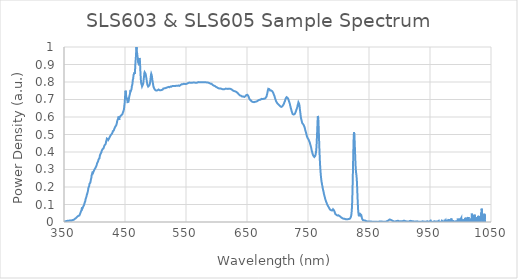
| Category | Power Density (a.u.) |
|---|---|
| 348.066 | 0.006 |
| 348.28 | 0.002 |
| 348.495 | 0.004 |
| 348.709 | 0.004 |
| 348.924 | 0.006 |
| 349.138 | 0.005 |
| 349.353 | 0.004 |
| 349.567 | 0.003 |
| 349.782 | 0.003 |
| 349.996 | 0.004 |
| 350.21 | 0.004 |
| 350.425 | 0.003 |
| 350.639 | 0.002 |
| 350.854 | 0.003 |
| 351.068 | 0.004 |
| 351.282 | 0.004 |
| 351.497 | 0.003 |
| 351.711 | 0.003 |
| 351.925 | 0.003 |
| 352.14 | 0.005 |
| 352.354 | 0.005 |
| 352.568 | 0.006 |
| 352.783 | 0.005 |
| 352.997 | 0.005 |
| 353.211 | 0.005 |
| 353.426 | 0.004 |
| 353.64 | 0.005 |
| 353.854 | 0.005 |
| 354.068 | 0.007 |
| 354.283 | 0.007 |
| 354.497 | 0.006 |
| 354.711 | 0.006 |
| 354.925 | 0.006 |
| 355.14 | 0.007 |
| 355.354 | 0.007 |
| 355.568 | 0.007 |
| 355.782 | 0.007 |
| 355.996 | 0.008 |
| 356.211 | 0.007 |
| 356.425 | 0.006 |
| 356.639 | 0.007 |
| 356.853 | 0.007 |
| 357.067 | 0.008 |
| 357.281 | 0.008 |
| 357.495 | 0.009 |
| 357.71 | 0.008 |
| 357.924 | 0.008 |
| 358.138 | 0.007 |
| 358.352 | 0.008 |
| 358.566 | 0.008 |
| 358.78 | 0.008 |
| 358.994 | 0.009 |
| 359.208 | 0.009 |
| 359.422 | 0.008 |
| 359.636 | 0.008 |
| 359.85 | 0.008 |
| 360.064 | 0.009 |
| 360.278 | 0.008 |
| 360.492 | 0.008 |
| 360.706 | 0.007 |
| 360.92 | 0.008 |
| 361.134 | 0.008 |
| 361.348 | 0.008 |
| 361.562 | 0.008 |
| 361.776 | 0.008 |
| 361.99 | 0.009 |
| 362.204 | 0.009 |
| 362.418 | 0.009 |
| 362.632 | 0.01 |
| 362.846 | 0.01 |
| 363.06 | 0.011 |
| 363.273 | 0.01 |
| 363.487 | 0.01 |
| 363.701 | 0.01 |
| 363.915 | 0.01 |
| 364.129 | 0.011 |
| 364.343 | 0.011 |
| 364.557 | 0.011 |
| 364.77 | 0.01 |
| 364.984 | 0.011 |
| 365.198 | 0.012 |
| 365.412 | 0.013 |
| 365.626 | 0.013 |
| 365.839 | 0.013 |
| 366.053 | 0.013 |
| 366.267 | 0.013 |
| 366.481 | 0.014 |
| 366.694 | 0.014 |
| 366.908 | 0.015 |
| 367.122 | 0.015 |
| 367.336 | 0.016 |
| 367.549 | 0.016 |
| 367.763 | 0.018 |
| 367.977 | 0.018 |
| 368.19 | 0.019 |
| 368.404 | 0.019 |
| 368.618 | 0.02 |
| 368.831 | 0.021 |
| 369.045 | 0.021 |
| 369.259 | 0.022 |
| 369.472 | 0.022 |
| 369.686 | 0.023 |
| 369.899 | 0.024 |
| 370.113 | 0.024 |
| 370.327 | 0.025 |
| 370.54 | 0.026 |
| 370.754 | 0.027 |
| 370.967 | 0.028 |
| 371.181 | 0.028 |
| 371.394 | 0.029 |
| 371.608 | 0.029 |
| 371.822 | 0.031 |
| 372.035 | 0.031 |
| 372.249 | 0.032 |
| 372.462 | 0.032 |
| 372.676 | 0.033 |
| 372.889 | 0.034 |
| 373.103 | 0.034 |
| 373.316 | 0.035 |
| 373.529 | 0.035 |
| 373.743 | 0.036 |
| 373.956 | 0.036 |
| 374.17 | 0.036 |
| 374.383 | 0.036 |
| 374.597 | 0.036 |
| 374.81 | 0.037 |
| 375.023 | 0.036 |
| 375.237 | 0.037 |
| 375.45 | 0.039 |
| 375.663 | 0.042 |
| 375.877 | 0.043 |
| 376.09 | 0.045 |
| 376.304 | 0.046 |
| 376.517 | 0.048 |
| 376.73 | 0.049 |
| 376.944 | 0.052 |
| 377.157 | 0.053 |
| 377.37 | 0.055 |
| 377.583 | 0.056 |
| 377.797 | 0.061 |
| 378.01 | 0.061 |
| 378.223 | 0.064 |
| 378.436 | 0.063 |
| 378.65 | 0.067 |
| 378.863 | 0.069 |
| 379.076 | 0.074 |
| 379.289 | 0.079 |
| 379.503 | 0.084 |
| 379.716 | 0.085 |
| 379.929 | 0.083 |
| 380.142 | 0.077 |
| 380.355 | 0.074 |
| 380.568 | 0.073 |
| 380.782 | 0.077 |
| 380.995 | 0.081 |
| 381.208 | 0.085 |
| 381.421 | 0.087 |
| 381.634 | 0.089 |
| 381.847 | 0.089 |
| 382.06 | 0.092 |
| 382.273 | 0.093 |
| 382.486 | 0.097 |
| 382.699 | 0.097 |
| 382.913 | 0.098 |
| 383.126 | 0.099 |
| 383.339 | 0.102 |
| 383.552 | 0.106 |
| 383.765 | 0.111 |
| 383.978 | 0.112 |
| 384.191 | 0.115 |
| 384.404 | 0.113 |
| 384.617 | 0.118 |
| 384.83 | 0.119 |
| 385.043 | 0.125 |
| 385.256 | 0.127 |
| 385.468 | 0.13 |
| 385.681 | 0.134 |
| 385.894 | 0.139 |
| 386.107 | 0.138 |
| 386.32 | 0.14 |
| 386.533 | 0.14 |
| 386.746 | 0.145 |
| 386.959 | 0.147 |
| 387.172 | 0.152 |
| 387.385 | 0.155 |
| 387.597 | 0.157 |
| 387.81 | 0.157 |
| 388.023 | 0.161 |
| 388.236 | 0.164 |
| 388.449 | 0.167 |
| 388.662 | 0.167 |
| 388.874 | 0.171 |
| 389.087 | 0.174 |
| 389.3 | 0.18 |
| 389.513 | 0.183 |
| 389.725 | 0.19 |
| 389.938 | 0.191 |
| 390.151 | 0.197 |
| 390.364 | 0.196 |
| 390.576 | 0.199 |
| 390.789 | 0.198 |
| 391.002 | 0.202 |
| 391.215 | 0.205 |
| 391.427 | 0.211 |
| 391.64 | 0.213 |
| 391.853 | 0.219 |
| 392.065 | 0.221 |
| 392.278 | 0.222 |
| 392.491 | 0.218 |
| 392.703 | 0.219 |
| 392.916 | 0.221 |
| 393.128 | 0.225 |
| 393.341 | 0.228 |
| 393.554 | 0.23 |
| 393.766 | 0.236 |
| 393.979 | 0.241 |
| 394.191 | 0.244 |
| 394.404 | 0.244 |
| 394.616 | 0.243 |
| 394.829 | 0.252 |
| 395.041 | 0.258 |
| 395.254 | 0.266 |
| 395.466 | 0.268 |
| 395.679 | 0.27 |
| 395.891 | 0.273 |
| 396.104 | 0.273 |
| 396.316 | 0.275 |
| 396.529 | 0.277 |
| 396.741 | 0.282 |
| 396.954 | 0.288 |
| 397.166 | 0.285 |
| 397.379 | 0.284 |
| 397.591 | 0.281 |
| 397.803 | 0.283 |
| 398.016 | 0.282 |
| 398.228 | 0.282 |
| 398.441 | 0.283 |
| 398.653 | 0.289 |
| 398.865 | 0.288 |
| 399.078 | 0.294 |
| 399.29 | 0.292 |
| 399.502 | 0.297 |
| 399.715 | 0.291 |
| 399.927 | 0.295 |
| 400.139 | 0.292 |
| 400.352 | 0.298 |
| 400.564 | 0.301 |
| 400.776 | 0.305 |
| 400.988 | 0.307 |
| 401.201 | 0.305 |
| 401.413 | 0.307 |
| 401.625 | 0.306 |
| 401.837 | 0.311 |
| 402.05 | 0.311 |
| 402.262 | 0.311 |
| 402.474 | 0.312 |
| 402.686 | 0.314 |
| 402.898 | 0.319 |
| 403.111 | 0.319 |
| 403.323 | 0.324 |
| 403.535 | 0.324 |
| 403.747 | 0.327 |
| 403.959 | 0.33 |
| 404.171 | 0.335 |
| 404.383 | 0.333 |
| 404.595 | 0.335 |
| 404.808 | 0.333 |
| 405.02 | 0.337 |
| 405.232 | 0.338 |
| 405.444 | 0.343 |
| 405.656 | 0.345 |
| 405.868 | 0.348 |
| 406.08 | 0.349 |
| 406.292 | 0.353 |
| 406.504 | 0.354 |
| 406.716 | 0.358 |
| 406.928 | 0.357 |
| 407.14 | 0.36 |
| 407.352 | 0.359 |
| 407.564 | 0.361 |
| 407.776 | 0.362 |
| 407.988 | 0.362 |
| 408.2 | 0.364 |
| 408.412 | 0.371 |
| 408.624 | 0.374 |
| 408.835 | 0.38 |
| 409.047 | 0.379 |
| 409.259 | 0.379 |
| 409.471 | 0.377 |
| 409.683 | 0.38 |
| 409.895 | 0.384 |
| 410.107 | 0.391 |
| 410.319 | 0.389 |
| 410.53 | 0.388 |
| 410.742 | 0.387 |
| 410.954 | 0.392 |
| 411.166 | 0.395 |
| 411.378 | 0.4 |
| 411.589 | 0.404 |
| 411.801 | 0.406 |
| 412.013 | 0.403 |
| 412.225 | 0.404 |
| 412.436 | 0.404 |
| 412.648 | 0.409 |
| 412.86 | 0.412 |
| 413.072 | 0.416 |
| 413.283 | 0.418 |
| 413.495 | 0.416 |
| 413.707 | 0.414 |
| 413.918 | 0.411 |
| 414.13 | 0.413 |
| 414.342 | 0.417 |
| 414.553 | 0.417 |
| 414.765 | 0.42 |
| 414.977 | 0.422 |
| 415.188 | 0.426 |
| 415.4 | 0.426 |
| 415.611 | 0.425 |
| 415.823 | 0.423 |
| 416.035 | 0.426 |
| 416.246 | 0.429 |
| 416.458 | 0.438 |
| 416.669 | 0.438 |
| 416.881 | 0.436 |
| 417.092 | 0.434 |
| 417.304 | 0.434 |
| 417.515 | 0.438 |
| 417.727 | 0.441 |
| 417.938 | 0.443 |
| 418.15 | 0.445 |
| 418.361 | 0.443 |
| 418.573 | 0.45 |
| 418.784 | 0.454 |
| 418.996 | 0.46 |
| 419.207 | 0.46 |
| 419.419 | 0.464 |
| 419.63 | 0.464 |
| 419.841 | 0.469 |
| 420.053 | 0.469 |
| 420.264 | 0.476 |
| 420.475 | 0.475 |
| 420.687 | 0.475 |
| 420.898 | 0.476 |
| 421.11 | 0.475 |
| 421.321 | 0.477 |
| 421.532 | 0.472 |
| 421.744 | 0.472 |
| 421.955 | 0.471 |
| 422.166 | 0.47 |
| 422.377 | 0.477 |
| 422.589 | 0.476 |
| 422.8 | 0.479 |
| 423.011 | 0.473 |
| 423.222 | 0.474 |
| 423.434 | 0.472 |
| 423.645 | 0.477 |
| 423.856 | 0.473 |
| 424.067 | 0.474 |
| 424.279 | 0.474 |
| 424.49 | 0.481 |
| 424.701 | 0.482 |
| 424.912 | 0.481 |
| 425.123 | 0.481 |
| 425.334 | 0.485 |
| 425.545 | 0.486 |
| 425.757 | 0.492 |
| 425.968 | 0.491 |
| 426.179 | 0.493 |
| 426.39 | 0.486 |
| 426.601 | 0.491 |
| 426.812 | 0.495 |
| 427.023 | 0.498 |
| 427.234 | 0.499 |
| 427.445 | 0.499 |
| 427.656 | 0.501 |
| 427.867 | 0.502 |
| 428.078 | 0.501 |
| 428.289 | 0.501 |
| 428.5 | 0.502 |
| 428.711 | 0.505 |
| 428.922 | 0.506 |
| 429.133 | 0.508 |
| 429.344 | 0.508 |
| 429.555 | 0.512 |
| 429.766 | 0.514 |
| 429.977 | 0.518 |
| 430.188 | 0.516 |
| 430.399 | 0.518 |
| 430.61 | 0.515 |
| 430.821 | 0.518 |
| 431.031 | 0.519 |
| 431.242 | 0.521 |
| 431.453 | 0.523 |
| 431.664 | 0.524 |
| 431.875 | 0.528 |
| 432.086 | 0.525 |
| 432.297 | 0.529 |
| 432.507 | 0.533 |
| 432.718 | 0.537 |
| 432.929 | 0.536 |
| 433.14 | 0.535 |
| 433.35 | 0.537 |
| 433.561 | 0.533 |
| 433.772 | 0.537 |
| 433.983 | 0.538 |
| 434.193 | 0.546 |
| 434.404 | 0.544 |
| 434.615 | 0.547 |
| 434.826 | 0.545 |
| 435.036 | 0.547 |
| 435.247 | 0.551 |
| 435.458 | 0.552 |
| 435.668 | 0.556 |
| 435.879 | 0.555 |
| 436.09 | 0.558 |
| 436.3 | 0.559 |
| 436.511 | 0.561 |
| 436.721 | 0.567 |
| 436.932 | 0.573 |
| 437.143 | 0.574 |
| 437.353 | 0.575 |
| 437.564 | 0.57 |
| 437.774 | 0.576 |
| 437.985 | 0.579 |
| 438.195 | 0.587 |
| 438.406 | 0.587 |
| 438.616 | 0.586 |
| 438.827 | 0.588 |
| 439.037 | 0.593 |
| 439.248 | 0.597 |
| 439.458 | 0.603 |
| 439.669 | 0.599 |
| 439.879 | 0.602 |
| 440.09 | 0.59 |
| 440.3 | 0.588 |
| 440.51 | 0.583 |
| 440.721 | 0.591 |
| 440.931 | 0.597 |
| 441.142 | 0.596 |
| 441.352 | 0.592 |
| 441.562 | 0.593 |
| 441.773 | 0.595 |
| 441.983 | 0.6 |
| 442.193 | 0.603 |
| 442.404 | 0.606 |
| 442.614 | 0.602 |
| 442.824 | 0.604 |
| 443.035 | 0.601 |
| 443.245 | 0.601 |
| 443.455 | 0.6 |
| 443.666 | 0.604 |
| 443.876 | 0.61 |
| 444.086 | 0.611 |
| 444.296 | 0.614 |
| 444.507 | 0.613 |
| 444.717 | 0.609 |
| 444.927 | 0.607 |
| 445.137 | 0.61 |
| 445.347 | 0.615 |
| 445.558 | 0.615 |
| 445.768 | 0.612 |
| 445.978 | 0.612 |
| 446.188 | 0.616 |
| 446.398 | 0.613 |
| 446.608 | 0.62 |
| 446.818 | 0.618 |
| 447.028 | 0.63 |
| 447.239 | 0.63 |
| 447.449 | 0.635 |
| 447.659 | 0.628 |
| 447.869 | 0.628 |
| 448.079 | 0.632 |
| 448.289 | 0.643 |
| 448.499 | 0.649 |
| 448.709 | 0.658 |
| 448.919 | 0.661 |
| 449.129 | 0.671 |
| 449.339 | 0.672 |
| 449.549 | 0.683 |
| 449.759 | 0.695 |
| 449.969 | 0.711 |
| 450.179 | 0.719 |
| 450.389 | 0.726 |
| 450.599 | 0.738 |
| 450.809 | 0.75 |
| 451.018 | 0.751 |
| 451.228 | 0.752 |
| 451.438 | 0.741 |
| 451.648 | 0.734 |
| 451.858 | 0.722 |
| 452.068 | 0.715 |
| 452.278 | 0.712 |
| 452.487 | 0.713 |
| 452.697 | 0.714 |
| 452.907 | 0.716 |
| 453.117 | 0.707 |
| 453.327 | 0.708 |
| 453.536 | 0.699 |
| 453.746 | 0.697 |
| 453.956 | 0.691 |
| 454.166 | 0.685 |
| 454.376 | 0.687 |
| 454.585 | 0.688 |
| 454.795 | 0.687 |
| 455.005 | 0.686 |
| 455.214 | 0.683 |
| 455.424 | 0.681 |
| 455.634 | 0.68 |
| 455.843 | 0.687 |
| 456.053 | 0.695 |
| 456.263 | 0.698 |
| 456.472 | 0.704 |
| 456.682 | 0.711 |
| 456.892 | 0.712 |
| 457.101 | 0.716 |
| 457.311 | 0.721 |
| 457.52 | 0.721 |
| 457.73 | 0.724 |
| 457.939 | 0.729 |
| 458.149 | 0.731 |
| 458.359 | 0.729 |
| 458.568 | 0.731 |
| 458.778 | 0.747 |
| 458.987 | 0.752 |
| 459.197 | 0.755 |
| 459.406 | 0.749 |
| 459.616 | 0.754 |
| 459.825 | 0.747 |
| 460.034 | 0.748 |
| 460.244 | 0.744 |
| 460.453 | 0.747 |
| 460.663 | 0.758 |
| 460.872 | 0.765 |
| 461.082 | 0.774 |
| 461.291 | 0.772 |
| 461.5 | 0.775 |
| 461.71 | 0.781 |
| 461.919 | 0.78 |
| 462.128 | 0.789 |
| 462.338 | 0.788 |
| 462.547 | 0.802 |
| 462.756 | 0.812 |
| 462.966 | 0.814 |
| 463.175 | 0.817 |
| 463.384 | 0.819 |
| 463.594 | 0.826 |
| 463.803 | 0.832 |
| 464.012 | 0.84 |
| 464.221 | 0.845 |
| 464.431 | 0.838 |
| 464.64 | 0.84 |
| 464.849 | 0.84 |
| 465.058 | 0.847 |
| 465.267 | 0.848 |
| 465.477 | 0.854 |
| 465.686 | 0.846 |
| 465.895 | 0.85 |
| 466.104 | 0.852 |
| 466.313 | 0.859 |
| 466.522 | 0.871 |
| 466.731 | 0.881 |
| 466.941 | 0.9 |
| 467.15 | 0.905 |
| 467.359 | 0.922 |
| 467.568 | 0.93 |
| 467.777 | 0.93 |
| 467.986 | 0.951 |
| 468.195 | 0.964 |
| 468.404 | 0.983 |
| 468.613 | 0.985 |
| 468.822 | 1 |
| 469.031 | 1 |
| 469.24 | 0.986 |
| 469.449 | 0.974 |
| 469.658 | 0.973 |
| 469.867 | 0.966 |
| 470.076 | 0.961 |
| 470.285 | 0.952 |
| 470.494 | 0.944 |
| 470.703 | 0.944 |
| 470.912 | 0.942 |
| 471.12 | 0.936 |
| 471.329 | 0.92 |
| 471.538 | 0.911 |
| 471.747 | 0.909 |
| 471.956 | 0.908 |
| 472.165 | 0.908 |
| 472.374 | 0.905 |
| 472.582 | 0.902 |
| 472.791 | 0.905 |
| 473.0 | 0.911 |
| 473.209 | 0.922 |
| 473.417 | 0.93 |
| 473.626 | 0.936 |
| 473.835 | 0.939 |
| 474.044 | 0.94 |
| 474.252 | 0.929 |
| 474.461 | 0.92 |
| 474.67 | 0.906 |
| 474.879 | 0.888 |
| 475.087 | 0.871 |
| 475.296 | 0.854 |
| 475.505 | 0.842 |
| 475.713 | 0.828 |
| 475.922 | 0.816 |
| 476.131 | 0.807 |
| 476.339 | 0.798 |
| 476.548 | 0.793 |
| 476.756 | 0.789 |
| 476.965 | 0.79 |
| 477.174 | 0.787 |
| 477.382 | 0.785 |
| 477.591 | 0.782 |
| 477.799 | 0.778 |
| 478.008 | 0.775 |
| 478.216 | 0.773 |
| 478.425 | 0.775 |
| 478.633 | 0.777 |
| 478.842 | 0.782 |
| 479.05 | 0.784 |
| 479.259 | 0.785 |
| 479.467 | 0.784 |
| 479.676 | 0.789 |
| 479.884 | 0.79 |
| 480.092 | 0.797 |
| 480.301 | 0.806 |
| 480.509 | 0.811 |
| 480.718 | 0.818 |
| 480.926 | 0.822 |
| 481.134 | 0.83 |
| 481.343 | 0.836 |
| 481.551 | 0.844 |
| 481.759 | 0.85 |
| 481.968 | 0.853 |
| 482.176 | 0.856 |
| 482.384 | 0.859 |
| 482.593 | 0.857 |
| 482.801 | 0.856 |
| 483.009 | 0.855 |
| 483.218 | 0.852 |
| 483.426 | 0.852 |
| 483.634 | 0.848 |
| 483.842 | 0.849 |
| 484.05 | 0.842 |
| 484.259 | 0.84 |
| 484.467 | 0.834 |
| 484.675 | 0.83 |
| 484.883 | 0.825 |
| 485.091 | 0.821 |
| 485.3 | 0.816 |
| 485.508 | 0.811 |
| 485.716 | 0.804 |
| 485.924 | 0.8 |
| 486.132 | 0.797 |
| 486.34 | 0.793 |
| 486.548 | 0.786 |
| 486.756 | 0.784 |
| 486.964 | 0.783 |
| 487.172 | 0.781 |
| 487.38 | 0.777 |
| 487.588 | 0.776 |
| 487.796 | 0.775 |
| 488.004 | 0.774 |
| 488.212 | 0.773 |
| 488.42 | 0.776 |
| 488.628 | 0.773 |
| 488.836 | 0.772 |
| 489.044 | 0.771 |
| 489.252 | 0.775 |
| 489.46 | 0.775 |
| 489.668 | 0.78 |
| 489.876 | 0.78 |
| 490.084 | 0.783 |
| 490.292 | 0.782 |
| 490.5 | 0.786 |
| 490.708 | 0.79 |
| 490.915 | 0.793 |
| 491.123 | 0.797 |
| 491.331 | 0.802 |
| 491.539 | 0.808 |
| 491.747 | 0.814 |
| 491.954 | 0.818 |
| 492.162 | 0.826 |
| 492.37 | 0.831 |
| 492.578 | 0.84 |
| 492.786 | 0.842 |
| 492.993 | 0.847 |
| 493.201 | 0.845 |
| 493.409 | 0.842 |
| 493.616 | 0.841 |
| 493.824 | 0.837 |
| 494.032 | 0.834 |
| 494.239 | 0.83 |
| 494.447 | 0.823 |
| 494.655 | 0.817 |
| 494.862 | 0.811 |
| 495.07 | 0.808 |
| 495.278 | 0.802 |
| 495.485 | 0.798 |
| 495.693 | 0.794 |
| 495.9 | 0.788 |
| 496.108 | 0.786 |
| 496.316 | 0.781 |
| 496.523 | 0.776 |
| 496.731 | 0.774 |
| 496.938 | 0.772 |
| 497.146 | 0.772 |
| 497.353 | 0.766 |
| 497.561 | 0.766 |
| 497.768 | 0.765 |
| 497.976 | 0.762 |
| 498.183 | 0.762 |
| 498.391 | 0.761 |
| 498.598 | 0.758 |
| 498.805 | 0.758 |
| 499.013 | 0.755 |
| 499.22 | 0.758 |
| 499.428 | 0.754 |
| 499.635 | 0.755 |
| 499.842 | 0.753 |
| 500.05 | 0.753 |
| 500.257 | 0.753 |
| 500.464 | 0.754 |
| 500.672 | 0.754 |
| 500.879 | 0.754 |
| 501.086 | 0.754 |
| 501.294 | 0.751 |
| 501.501 | 0.751 |
| 501.708 | 0.751 |
| 501.915 | 0.752 |
| 502.123 | 0.753 |
| 502.33 | 0.752 |
| 502.537 | 0.754 |
| 502.744 | 0.752 |
| 502.952 | 0.753 |
| 503.159 | 0.753 |
| 503.366 | 0.753 |
| 503.573 | 0.757 |
| 503.78 | 0.756 |
| 503.987 | 0.756 |
| 504.195 | 0.755 |
| 504.402 | 0.757 |
| 504.609 | 0.757 |
| 504.816 | 0.757 |
| 505.023 | 0.757 |
| 505.23 | 0.758 |
| 505.437 | 0.757 |
| 505.644 | 0.755 |
| 505.851 | 0.755 |
| 506.058 | 0.754 |
| 506.265 | 0.754 |
| 506.472 | 0.753 |
| 506.679 | 0.753 |
| 506.886 | 0.753 |
| 507.093 | 0.753 |
| 507.3 | 0.754 |
| 507.507 | 0.755 |
| 507.714 | 0.755 |
| 507.921 | 0.754 |
| 508.128 | 0.753 |
| 508.335 | 0.753 |
| 508.542 | 0.753 |
| 508.749 | 0.755 |
| 508.955 | 0.755 |
| 509.162 | 0.755 |
| 509.369 | 0.753 |
| 509.576 | 0.755 |
| 509.783 | 0.754 |
| 509.99 | 0.754 |
| 510.196 | 0.754 |
| 510.403 | 0.755 |
| 510.61 | 0.754 |
| 510.817 | 0.755 |
| 511.023 | 0.757 |
| 511.23 | 0.758 |
| 511.437 | 0.757 |
| 511.644 | 0.757 |
| 511.85 | 0.757 |
| 512.057 | 0.759 |
| 512.264 | 0.76 |
| 512.47 | 0.761 |
| 512.677 | 0.76 |
| 512.884 | 0.763 |
| 513.09 | 0.761 |
| 513.297 | 0.762 |
| 513.504 | 0.761 |
| 513.71 | 0.764 |
| 513.917 | 0.764 |
| 514.123 | 0.766 |
| 514.33 | 0.766 |
| 514.537 | 0.764 |
| 514.743 | 0.765 |
| 514.95 | 0.764 |
| 515.156 | 0.766 |
| 515.363 | 0.764 |
| 515.569 | 0.766 |
| 515.776 | 0.765 |
| 515.982 | 0.765 |
| 516.189 | 0.765 |
| 516.395 | 0.765 |
| 516.601 | 0.765 |
| 516.808 | 0.765 |
| 517.014 | 0.765 |
| 517.221 | 0.766 |
| 517.427 | 0.768 |
| 517.634 | 0.768 |
| 517.84 | 0.767 |
| 518.046 | 0.767 |
| 518.253 | 0.767 |
| 518.459 | 0.766 |
| 518.665 | 0.767 |
| 518.872 | 0.767 |
| 519.078 | 0.769 |
| 519.284 | 0.77 |
| 519.49 | 0.769 |
| 519.697 | 0.769 |
| 519.903 | 0.769 |
| 520.109 | 0.769 |
| 520.315 | 0.769 |
| 520.522 | 0.77 |
| 520.728 | 0.769 |
| 520.934 | 0.771 |
| 521.14 | 0.772 |
| 521.346 | 0.773 |
| 521.553 | 0.773 |
| 521.759 | 0.772 |
| 521.965 | 0.771 |
| 522.171 | 0.77 |
| 522.377 | 0.772 |
| 522.583 | 0.771 |
| 522.789 | 0.77 |
| 522.995 | 0.772 |
| 523.202 | 0.774 |
| 523.408 | 0.774 |
| 523.614 | 0.774 |
| 523.82 | 0.771 |
| 524.026 | 0.772 |
| 524.232 | 0.771 |
| 524.438 | 0.774 |
| 524.644 | 0.773 |
| 524.85 | 0.774 |
| 525.056 | 0.775 |
| 525.262 | 0.774 |
| 525.468 | 0.775 |
| 525.673 | 0.776 |
| 525.879 | 0.775 |
| 526.085 | 0.773 |
| 526.291 | 0.773 |
| 526.497 | 0.774 |
| 526.703 | 0.775 |
| 526.909 | 0.776 |
| 527.115 | 0.777 |
| 527.32 | 0.775 |
| 527.526 | 0.775 |
| 527.732 | 0.777 |
| 527.938 | 0.777 |
| 528.144 | 0.776 |
| 528.349 | 0.775 |
| 528.555 | 0.777 |
| 528.761 | 0.775 |
| 528.967 | 0.778 |
| 529.172 | 0.778 |
| 529.378 | 0.777 |
| 529.584 | 0.777 |
| 529.79 | 0.777 |
| 529.995 | 0.778 |
| 530.201 | 0.776 |
| 530.407 | 0.777 |
| 530.612 | 0.778 |
| 530.818 | 0.776 |
| 531.023 | 0.778 |
| 531.229 | 0.777 |
| 531.435 | 0.777 |
| 531.64 | 0.776 |
| 531.846 | 0.777 |
| 532.051 | 0.777 |
| 532.257 | 0.776 |
| 532.462 | 0.777 |
| 532.668 | 0.777 |
| 532.874 | 0.776 |
| 533.079 | 0.778 |
| 533.285 | 0.777 |
| 533.49 | 0.779 |
| 533.695 | 0.778 |
| 533.901 | 0.78 |
| 534.106 | 0.779 |
| 534.312 | 0.779 |
| 534.517 | 0.779 |
| 534.723 | 0.78 |
| 534.928 | 0.779 |
| 535.133 | 0.78 |
| 535.339 | 0.778 |
| 535.544 | 0.78 |
| 535.749 | 0.778 |
| 535.955 | 0.778 |
| 536.16 | 0.779 |
| 536.365 | 0.78 |
| 536.571 | 0.78 |
| 536.776 | 0.78 |
| 536.981 | 0.779 |
| 537.187 | 0.78 |
| 537.392 | 0.779 |
| 537.597 | 0.78 |
| 537.802 | 0.777 |
| 538.008 | 0.78 |
| 538.213 | 0.779 |
| 538.418 | 0.781 |
| 538.623 | 0.781 |
| 538.828 | 0.78 |
| 539.033 | 0.778 |
| 539.239 | 0.778 |
| 539.444 | 0.78 |
| 539.649 | 0.78 |
| 539.854 | 0.78 |
| 540.059 | 0.781 |
| 540.264 | 0.78 |
| 540.469 | 0.781 |
| 540.674 | 0.781 |
| 540.879 | 0.782 |
| 541.084 | 0.782 |
| 541.289 | 0.784 |
| 541.494 | 0.783 |
| 541.699 | 0.784 |
| 541.904 | 0.782 |
| 542.109 | 0.785 |
| 542.314 | 0.784 |
| 542.519 | 0.787 |
| 542.724 | 0.787 |
| 542.929 | 0.786 |
| 543.134 | 0.787 |
| 543.339 | 0.785 |
| 543.544 | 0.786 |
| 543.749 | 0.786 |
| 543.954 | 0.787 |
| 544.158 | 0.788 |
| 544.363 | 0.787 |
| 544.568 | 0.788 |
| 544.773 | 0.787 |
| 544.978 | 0.789 |
| 545.183 | 0.788 |
| 545.387 | 0.788 |
| 545.592 | 0.788 |
| 545.797 | 0.788 |
| 546.002 | 0.79 |
| 546.206 | 0.79 |
| 546.411 | 0.789 |
| 546.616 | 0.788 |
| 546.82 | 0.788 |
| 547.025 | 0.79 |
| 547.23 | 0.789 |
| 547.434 | 0.79 |
| 547.639 | 0.79 |
| 547.844 | 0.79 |
| 548.048 | 0.789 |
| 548.253 | 0.79 |
| 548.458 | 0.789 |
| 548.662 | 0.79 |
| 548.867 | 0.79 |
| 549.071 | 0.79 |
| 549.276 | 0.791 |
| 549.48 | 0.79 |
| 549.685 | 0.79 |
| 549.889 | 0.788 |
| 550.094 | 0.789 |
| 550.298 | 0.79 |
| 550.503 | 0.789 |
| 550.707 | 0.79 |
| 550.912 | 0.791 |
| 551.116 | 0.793 |
| 551.321 | 0.792 |
| 551.525 | 0.793 |
| 551.73 | 0.791 |
| 551.934 | 0.792 |
| 552.138 | 0.792 |
| 552.343 | 0.792 |
| 552.547 | 0.791 |
| 552.751 | 0.793 |
| 552.956 | 0.793 |
| 553.16 | 0.795 |
| 553.364 | 0.793 |
| 553.569 | 0.794 |
| 553.773 | 0.795 |
| 553.977 | 0.796 |
| 554.181 | 0.796 |
| 554.386 | 0.795 |
| 554.59 | 0.794 |
| 554.794 | 0.794 |
| 554.998 | 0.794 |
| 555.203 | 0.796 |
| 555.407 | 0.797 |
| 555.611 | 0.796 |
| 555.815 | 0.795 |
| 556.019 | 0.795 |
| 556.223 | 0.795 |
| 556.427 | 0.796 |
| 556.632 | 0.795 |
| 556.836 | 0.795 |
| 557.04 | 0.795 |
| 557.244 | 0.796 |
| 557.448 | 0.794 |
| 557.652 | 0.796 |
| 557.856 | 0.793 |
| 558.06 | 0.796 |
| 558.264 | 0.792 |
| 558.468 | 0.795 |
| 558.672 | 0.795 |
| 558.876 | 0.797 |
| 559.08 | 0.796 |
| 559.284 | 0.796 |
| 559.488 | 0.795 |
| 559.692 | 0.795 |
| 559.896 | 0.793 |
| 560.1 | 0.795 |
| 560.303 | 0.795 |
| 560.507 | 0.796 |
| 560.711 | 0.796 |
| 560.915 | 0.796 |
| 561.119 | 0.796 |
| 561.323 | 0.795 |
| 561.527 | 0.795 |
| 561.73 | 0.797 |
| 561.934 | 0.796 |
| 562.138 | 0.796 |
| 562.342 | 0.795 |
| 562.545 | 0.798 |
| 562.749 | 0.797 |
| 562.953 | 0.796 |
| 563.157 | 0.796 |
| 563.36 | 0.796 |
| 563.564 | 0.796 |
| 563.768 | 0.794 |
| 563.971 | 0.795 |
| 564.175 | 0.795 |
| 564.379 | 0.795 |
| 564.582 | 0.796 |
| 564.786 | 0.797 |
| 564.989 | 0.797 |
| 565.193 | 0.795 |
| 565.397 | 0.794 |
| 565.6 | 0.793 |
| 565.804 | 0.795 |
| 566.007 | 0.796 |
| 566.211 | 0.796 |
| 566.414 | 0.796 |
| 566.618 | 0.795 |
| 566.821 | 0.796 |
| 567.025 | 0.797 |
| 567.228 | 0.796 |
| 567.432 | 0.799 |
| 567.635 | 0.792 |
| 567.839 | 0.796 |
| 568.042 | 0.794 |
| 568.245 | 0.796 |
| 568.449 | 0.798 |
| 568.652 | 0.797 |
| 568.855 | 0.798 |
| 569.059 | 0.796 |
| 569.262 | 0.796 |
| 569.466 | 0.797 |
| 569.669 | 0.797 |
| 569.872 | 0.801 |
| 570.075 | 0.8 |
| 570.279 | 0.8 |
| 570.482 | 0.797 |
| 570.685 | 0.797 |
| 570.888 | 0.797 |
| 571.092 | 0.799 |
| 571.295 | 0.8 |
| 571.498 | 0.8 |
| 571.701 | 0.8 |
| 571.904 | 0.798 |
| 572.108 | 0.796 |
| 572.311 | 0.796 |
| 572.514 | 0.796 |
| 572.717 | 0.799 |
| 572.92 | 0.799 |
| 573.123 | 0.799 |
| 573.326 | 0.797 |
| 573.529 | 0.796 |
| 573.732 | 0.798 |
| 573.935 | 0.798 |
| 574.139 | 0.799 |
| 574.342 | 0.797 |
| 574.545 | 0.798 |
| 574.748 | 0.797 |
| 574.951 | 0.797 |
| 575.154 | 0.798 |
| 575.356 | 0.798 |
| 575.559 | 0.798 |
| 575.762 | 0.799 |
| 575.965 | 0.799 |
| 576.168 | 0.799 |
| 576.371 | 0.798 |
| 576.574 | 0.799 |
| 576.777 | 0.799 |
| 576.98 | 0.798 |
| 577.183 | 0.798 |
| 577.385 | 0.798 |
| 577.588 | 0.799 |
| 577.791 | 0.798 |
| 577.994 | 0.799 |
| 578.197 | 0.798 |
| 578.399 | 0.798 |
| 578.602 | 0.797 |
| 578.805 | 0.799 |
| 579.008 | 0.797 |
| 579.21 | 0.799 |
| 579.413 | 0.796 |
| 579.616 | 0.8 |
| 579.818 | 0.797 |
| 580.021 | 0.799 |
| 580.224 | 0.796 |
| 580.426 | 0.797 |
| 580.629 | 0.798 |
| 580.832 | 0.799 |
| 581.034 | 0.798 |
| 581.237 | 0.798 |
| 581.439 | 0.798 |
| 581.642 | 0.799 |
| 581.844 | 0.797 |
| 582.047 | 0.798 |
| 582.25 | 0.795 |
| 582.452 | 0.796 |
| 582.655 | 0.795 |
| 582.857 | 0.798 |
| 583.06 | 0.796 |
| 583.262 | 0.799 |
| 583.464 | 0.796 |
| 583.667 | 0.798 |
| 583.869 | 0.796 |
| 584.072 | 0.798 |
| 584.274 | 0.795 |
| 584.476 | 0.797 |
| 584.679 | 0.797 |
| 584.881 | 0.797 |
| 585.084 | 0.796 |
| 585.286 | 0.795 |
| 585.488 | 0.796 |
| 585.691 | 0.796 |
| 585.893 | 0.794 |
| 586.095 | 0.796 |
| 586.297 | 0.795 |
| 586.5 | 0.796 |
| 586.702 | 0.796 |
| 586.904 | 0.796 |
| 587.106 | 0.796 |
| 587.309 | 0.794 |
| 587.511 | 0.794 |
| 587.713 | 0.795 |
| 587.915 | 0.794 |
| 588.117 | 0.794 |
| 588.319 | 0.794 |
| 588.521 | 0.794 |
| 588.724 | 0.794 |
| 588.926 | 0.791 |
| 589.128 | 0.792 |
| 589.33 | 0.793 |
| 589.532 | 0.793 |
| 589.734 | 0.794 |
| 589.936 | 0.791 |
| 590.138 | 0.79 |
| 590.34 | 0.79 |
| 590.542 | 0.792 |
| 590.744 | 0.79 |
| 590.946 | 0.791 |
| 591.148 | 0.79 |
| 591.35 | 0.791 |
| 591.552 | 0.788 |
| 591.754 | 0.789 |
| 591.956 | 0.79 |
| 592.158 | 0.789 |
| 592.359 | 0.788 |
| 592.561 | 0.787 |
| 592.763 | 0.787 |
| 592.965 | 0.787 |
| 593.167 | 0.785 |
| 593.369 | 0.784 |
| 593.57 | 0.784 |
| 593.772 | 0.784 |
| 593.974 | 0.785 |
| 594.176 | 0.784 |
| 594.378 | 0.785 |
| 594.579 | 0.783 |
| 594.781 | 0.782 |
| 594.983 | 0.782 |
| 595.184 | 0.78 |
| 595.386 | 0.781 |
| 595.588 | 0.779 |
| 595.789 | 0.782 |
| 595.991 | 0.78 |
| 596.193 | 0.781 |
| 596.394 | 0.778 |
| 596.596 | 0.778 |
| 596.798 | 0.777 |
| 596.999 | 0.778 |
| 597.201 | 0.776 |
| 597.402 | 0.777 |
| 597.604 | 0.776 |
| 597.805 | 0.775 |
| 598.007 | 0.775 |
| 598.208 | 0.773 |
| 598.41 | 0.773 |
| 598.611 | 0.773 |
| 598.813 | 0.773 |
| 599.014 | 0.773 |
| 599.216 | 0.771 |
| 599.417 | 0.771 |
| 599.618 | 0.772 |
| 599.82 | 0.771 |
| 600.021 | 0.77 |
| 600.223 | 0.769 |
| 600.424 | 0.769 |
| 600.625 | 0.77 |
| 600.827 | 0.769 |
| 601.028 | 0.768 |
| 601.229 | 0.767 |
| 601.431 | 0.767 |
| 601.632 | 0.765 |
| 601.833 | 0.767 |
| 602.034 | 0.766 |
| 602.236 | 0.765 |
| 602.437 | 0.765 |
| 602.638 | 0.765 |
| 602.839 | 0.766 |
| 603.04 | 0.765 |
| 603.242 | 0.764 |
| 603.443 | 0.764 |
| 603.644 | 0.761 |
| 603.845 | 0.763 |
| 604.046 | 0.763 |
| 604.247 | 0.763 |
| 604.448 | 0.762 |
| 604.649 | 0.762 |
| 604.851 | 0.763 |
| 605.052 | 0.763 |
| 605.253 | 0.763 |
| 605.454 | 0.762 |
| 605.655 | 0.762 |
| 605.856 | 0.76 |
| 606.057 | 0.763 |
| 606.258 | 0.762 |
| 606.459 | 0.761 |
| 606.66 | 0.761 |
| 606.86 | 0.76 |
| 607.061 | 0.76 |
| 607.262 | 0.759 |
| 607.463 | 0.762 |
| 607.664 | 0.759 |
| 607.865 | 0.762 |
| 608.066 | 0.758 |
| 608.267 | 0.76 |
| 608.467 | 0.759 |
| 608.668 | 0.759 |
| 608.869 | 0.758 |
| 609.07 | 0.759 |
| 609.271 | 0.759 |
| 609.471 | 0.76 |
| 609.672 | 0.759 |
| 609.873 | 0.76 |
| 610.074 | 0.76 |
| 610.274 | 0.758 |
| 610.475 | 0.76 |
| 610.676 | 0.759 |
| 610.876 | 0.76 |
| 611.077 | 0.76 |
| 611.278 | 0.759 |
| 611.478 | 0.759 |
| 611.679 | 0.758 |
| 611.88 | 0.76 |
| 612.08 | 0.76 |
| 612.281 | 0.76 |
| 612.481 | 0.76 |
| 612.682 | 0.759 |
| 612.882 | 0.759 |
| 613.083 | 0.761 |
| 613.283 | 0.759 |
| 613.484 | 0.761 |
| 613.684 | 0.759 |
| 613.885 | 0.758 |
| 614.085 | 0.759 |
| 614.286 | 0.761 |
| 614.486 | 0.763 |
| 614.687 | 0.761 |
| 614.887 | 0.762 |
| 615.087 | 0.762 |
| 615.288 | 0.761 |
| 615.488 | 0.763 |
| 615.688 | 0.762 |
| 615.889 | 0.762 |
| 616.089 | 0.761 |
| 616.289 | 0.762 |
| 616.49 | 0.761 |
| 616.69 | 0.761 |
| 616.89 | 0.761 |
| 617.09 | 0.762 |
| 617.291 | 0.76 |
| 617.491 | 0.762 |
| 617.691 | 0.762 |
| 617.891 | 0.761 |
| 618.092 | 0.761 |
| 618.292 | 0.761 |
| 618.492 | 0.761 |
| 618.692 | 0.761 |
| 618.892 | 0.761 |
| 619.092 | 0.761 |
| 619.292 | 0.762 |
| 619.492 | 0.762 |
| 619.693 | 0.761 |
| 619.893 | 0.761 |
| 620.093 | 0.762 |
| 620.293 | 0.762 |
| 620.493 | 0.761 |
| 620.693 | 0.762 |
| 620.893 | 0.761 |
| 621.093 | 0.762 |
| 621.293 | 0.761 |
| 621.493 | 0.762 |
| 621.693 | 0.76 |
| 621.893 | 0.761 |
| 622.092 | 0.761 |
| 622.292 | 0.761 |
| 622.492 | 0.761 |
| 622.692 | 0.762 |
| 622.892 | 0.76 |
| 623.092 | 0.76 |
| 623.292 | 0.761 |
| 623.491 | 0.762 |
| 623.691 | 0.761 |
| 623.891 | 0.759 |
| 624.091 | 0.759 |
| 624.291 | 0.758 |
| 624.49 | 0.757 |
| 624.69 | 0.757 |
| 624.89 | 0.757 |
| 625.09 | 0.757 |
| 625.289 | 0.757 |
| 625.489 | 0.758 |
| 625.689 | 0.755 |
| 625.888 | 0.755 |
| 626.088 | 0.754 |
| 626.288 | 0.754 |
| 626.487 | 0.754 |
| 626.687 | 0.754 |
| 626.886 | 0.755 |
| 627.086 | 0.754 |
| 627.285 | 0.753 |
| 627.485 | 0.751 |
| 627.685 | 0.75 |
| 627.884 | 0.749 |
| 628.084 | 0.75 |
| 628.283 | 0.751 |
| 628.483 | 0.751 |
| 628.682 | 0.749 |
| 628.881 | 0.748 |
| 629.081 | 0.749 |
| 629.28 | 0.749 |
| 629.48 | 0.748 |
| 629.679 | 0.746 |
| 629.879 | 0.746 |
| 630.078 | 0.746 |
| 630.277 | 0.747 |
| 630.477 | 0.745 |
| 630.676 | 0.745 |
| 630.875 | 0.745 |
| 631.075 | 0.747 |
| 631.274 | 0.746 |
| 631.473 | 0.747 |
| 631.672 | 0.744 |
| 631.872 | 0.744 |
| 632.071 | 0.742 |
| 632.27 | 0.744 |
| 632.469 | 0.742 |
| 632.668 | 0.743 |
| 632.868 | 0.741 |
| 633.067 | 0.742 |
| 633.266 | 0.74 |
| 633.465 | 0.741 |
| 633.664 | 0.739 |
| 633.863 | 0.74 |
| 634.062 | 0.738 |
| 634.261 | 0.738 |
| 634.461 | 0.737 |
| 634.66 | 0.738 |
| 634.859 | 0.736 |
| 635.058 | 0.736 |
| 635.257 | 0.735 |
| 635.456 | 0.735 |
| 635.655 | 0.733 |
| 635.854 | 0.734 |
| 636.053 | 0.734 |
| 636.252 | 0.734 |
| 636.45 | 0.731 |
| 636.649 | 0.729 |
| 636.848 | 0.727 |
| 637.047 | 0.73 |
| 637.246 | 0.728 |
| 637.445 | 0.728 |
| 637.644 | 0.727 |
| 637.843 | 0.727 |
| 638.041 | 0.725 |
| 638.24 | 0.725 |
| 638.439 | 0.724 |
| 638.638 | 0.727 |
| 638.837 | 0.723 |
| 639.035 | 0.724 |
| 639.234 | 0.723 |
| 639.433 | 0.723 |
| 639.631 | 0.72 |
| 639.83 | 0.72 |
| 640.029 | 0.72 |
| 640.227 | 0.721 |
| 640.426 | 0.719 |
| 640.625 | 0.72 |
| 640.823 | 0.718 |
| 641.022 | 0.719 |
| 641.221 | 0.718 |
| 641.419 | 0.718 |
| 641.618 | 0.717 |
| 641.816 | 0.718 |
| 642.015 | 0.717 |
| 642.213 | 0.717 |
| 642.412 | 0.717 |
| 642.61 | 0.716 |
| 642.809 | 0.716 |
| 643.007 | 0.716 |
| 643.206 | 0.716 |
| 643.404 | 0.718 |
| 643.603 | 0.715 |
| 643.801 | 0.717 |
| 643.999 | 0.716 |
| 644.198 | 0.718 |
| 644.396 | 0.715 |
| 644.595 | 0.715 |
| 644.793 | 0.715 |
| 644.991 | 0.716 |
| 645.19 | 0.716 |
| 645.388 | 0.715 |
| 645.586 | 0.715 |
| 645.784 | 0.716 |
| 645.983 | 0.717 |
| 646.181 | 0.717 |
| 646.379 | 0.719 |
| 646.577 | 0.716 |
| 646.776 | 0.717 |
| 646.974 | 0.717 |
| 647.172 | 0.72 |
| 647.37 | 0.719 |
| 647.568 | 0.719 |
| 647.766 | 0.721 |
| 647.965 | 0.722 |
| 648.163 | 0.722 |
| 648.361 | 0.723 |
| 648.559 | 0.724 |
| 648.757 | 0.724 |
| 648.955 | 0.726 |
| 649.153 | 0.726 |
| 649.351 | 0.728 |
| 649.549 | 0.726 |
| 649.747 | 0.727 |
| 649.945 | 0.727 |
| 650.143 | 0.727 |
| 650.341 | 0.728 |
| 650.539 | 0.726 |
| 650.737 | 0.727 |
| 650.935 | 0.728 |
| 651.133 | 0.728 |
| 651.33 | 0.727 |
| 651.528 | 0.724 |
| 651.726 | 0.723 |
| 651.924 | 0.721 |
| 652.122 | 0.72 |
| 652.32 | 0.719 |
| 652.517 | 0.716 |
| 652.715 | 0.715 |
| 652.913 | 0.714 |
| 653.111 | 0.711 |
| 653.308 | 0.709 |
| 653.506 | 0.707 |
| 653.704 | 0.707 |
| 653.902 | 0.706 |
| 654.099 | 0.706 |
| 654.297 | 0.703 |
| 654.495 | 0.7 |
| 654.692 | 0.7 |
| 654.89 | 0.7 |
| 655.088 | 0.698 |
| 655.285 | 0.698 |
| 655.483 | 0.698 |
| 655.68 | 0.698 |
| 655.878 | 0.696 |
| 656.075 | 0.695 |
| 656.273 | 0.695 |
| 656.47 | 0.692 |
| 656.668 | 0.694 |
| 656.865 | 0.693 |
| 657.063 | 0.693 |
| 657.26 | 0.691 |
| 657.458 | 0.69 |
| 657.655 | 0.689 |
| 657.853 | 0.689 |
| 658.05 | 0.689 |
| 658.247 | 0.689 |
| 658.445 | 0.688 |
| 658.642 | 0.688 |
| 658.839 | 0.689 |
| 659.037 | 0.688 |
| 659.234 | 0.687 |
| 659.431 | 0.686 |
| 659.629 | 0.686 |
| 659.826 | 0.687 |
| 660.023 | 0.687 |
| 660.22 | 0.687 |
| 660.418 | 0.687 |
| 660.615 | 0.687 |
| 660.812 | 0.687 |
| 661.009 | 0.686 |
| 661.206 | 0.685 |
| 661.404 | 0.685 |
| 661.601 | 0.684 |
| 661.798 | 0.686 |
| 661.995 | 0.686 |
| 662.192 | 0.686 |
| 662.389 | 0.685 |
| 662.586 | 0.685 |
| 662.783 | 0.686 |
| 662.98 | 0.687 |
| 663.177 | 0.687 |
| 663.374 | 0.686 |
| 663.571 | 0.687 |
| 663.768 | 0.686 |
| 663.965 | 0.686 |
| 664.162 | 0.686 |
| 664.359 | 0.688 |
| 664.556 | 0.687 |
| 664.753 | 0.689 |
| 664.95 | 0.688 |
| 665.147 | 0.69 |
| 665.344 | 0.689 |
| 665.541 | 0.69 |
| 665.737 | 0.689 |
| 665.934 | 0.69 |
| 666.131 | 0.691 |
| 666.328 | 0.692 |
| 666.525 | 0.692 |
| 666.721 | 0.691 |
| 666.918 | 0.691 |
| 667.115 | 0.692 |
| 667.312 | 0.693 |
| 667.508 | 0.693 |
| 667.705 | 0.694 |
| 667.902 | 0.695 |
| 668.098 | 0.694 |
| 668.295 | 0.694 |
| 668.492 | 0.695 |
| 668.688 | 0.696 |
| 668.885 | 0.696 |
| 669.081 | 0.696 |
| 669.278 | 0.698 |
| 669.475 | 0.698 |
| 669.671 | 0.698 |
| 669.868 | 0.699 |
| 670.064 | 0.698 |
| 670.261 | 0.698 |
| 670.457 | 0.696 |
| 670.654 | 0.698 |
| 670.85 | 0.698 |
| 671.047 | 0.701 |
| 671.243 | 0.701 |
| 671.439 | 0.702 |
| 671.636 | 0.7 |
| 671.832 | 0.699 |
| 672.029 | 0.699 |
| 672.225 | 0.699 |
| 672.421 | 0.702 |
| 672.618 | 0.702 |
| 672.814 | 0.702 |
| 673.01 | 0.702 |
| 673.207 | 0.701 |
| 673.403 | 0.702 |
| 673.599 | 0.702 |
| 673.795 | 0.704 |
| 673.992 | 0.703 |
| 674.188 | 0.7 |
| 674.384 | 0.702 |
| 674.58 | 0.702 |
| 674.776 | 0.704 |
| 674.973 | 0.701 |
| 675.169 | 0.703 |
| 675.365 | 0.703 |
| 675.561 | 0.702 |
| 675.757 | 0.703 |
| 675.953 | 0.701 |
| 676.149 | 0.702 |
| 676.345 | 0.702 |
| 676.541 | 0.704 |
| 676.737 | 0.704 |
| 676.933 | 0.704 |
| 677.129 | 0.704 |
| 677.325 | 0.704 |
| 677.521 | 0.704 |
| 677.717 | 0.705 |
| 677.913 | 0.705 |
| 678.109 | 0.704 |
| 678.305 | 0.705 |
| 678.501 | 0.706 |
| 678.697 | 0.704 |
| 678.893 | 0.705 |
| 679.089 | 0.705 |
| 679.284 | 0.707 |
| 679.48 | 0.705 |
| 679.676 | 0.707 |
| 679.872 | 0.705 |
| 680.068 | 0.705 |
| 680.263 | 0.707 |
| 680.459 | 0.709 |
| 680.655 | 0.709 |
| 680.851 | 0.71 |
| 681.046 | 0.71 |
| 681.242 | 0.713 |
| 681.438 | 0.713 |
| 681.633 | 0.715 |
| 681.829 | 0.716 |
| 682.025 | 0.718 |
| 682.22 | 0.722 |
| 682.416 | 0.723 |
| 682.611 | 0.726 |
| 682.807 | 0.728 |
| 683.002 | 0.731 |
| 683.198 | 0.733 |
| 683.394 | 0.737 |
| 683.589 | 0.741 |
| 683.785 | 0.744 |
| 683.98 | 0.748 |
| 684.176 | 0.751 |
| 684.371 | 0.754 |
| 684.566 | 0.757 |
| 684.762 | 0.76 |
| 684.957 | 0.761 |
| 685.153 | 0.764 |
| 685.348 | 0.763 |
| 685.543 | 0.764 |
| 685.739 | 0.76 |
| 685.934 | 0.763 |
| 686.129 | 0.762 |
| 686.325 | 0.764 |
| 686.52 | 0.759 |
| 686.715 | 0.759 |
| 686.911 | 0.756 |
| 687.106 | 0.756 |
| 687.301 | 0.757 |
| 687.496 | 0.755 |
| 687.691 | 0.756 |
| 687.887 | 0.751 |
| 688.082 | 0.752 |
| 688.277 | 0.751 |
| 688.472 | 0.751 |
| 688.667 | 0.749 |
| 688.862 | 0.75 |
| 689.057 | 0.752 |
| 689.253 | 0.752 |
| 689.448 | 0.753 |
| 689.643 | 0.752 |
| 689.838 | 0.752 |
| 690.033 | 0.749 |
| 690.228 | 0.75 |
| 690.423 | 0.751 |
| 690.618 | 0.751 |
| 690.813 | 0.75 |
| 691.008 | 0.748 |
| 691.203 | 0.749 |
| 691.398 | 0.747 |
| 691.592 | 0.749 |
| 691.787 | 0.747 |
| 691.982 | 0.748 |
| 692.177 | 0.747 |
| 692.372 | 0.744 |
| 692.567 | 0.743 |
| 692.762 | 0.74 |
| 692.956 | 0.739 |
| 693.151 | 0.738 |
| 693.346 | 0.737 |
| 693.541 | 0.734 |
| 693.735 | 0.731 |
| 693.93 | 0.728 |
| 694.125 | 0.728 |
| 694.32 | 0.725 |
| 694.514 | 0.724 |
| 694.709 | 0.722 |
| 694.904 | 0.72 |
| 695.098 | 0.718 |
| 695.293 | 0.716 |
| 695.487 | 0.714 |
| 695.682 | 0.712 |
| 695.877 | 0.709 |
| 696.071 | 0.708 |
| 696.266 | 0.704 |
| 696.46 | 0.703 |
| 696.655 | 0.7 |
| 696.849 | 0.697 |
| 697.044 | 0.697 |
| 697.238 | 0.695 |
| 697.433 | 0.693 |
| 697.627 | 0.69 |
| 697.822 | 0.69 |
| 698.016 | 0.689 |
| 698.21 | 0.687 |
| 698.405 | 0.686 |
| 698.599 | 0.685 |
| 698.793 | 0.685 |
| 698.988 | 0.681 |
| 699.182 | 0.681 |
| 699.376 | 0.679 |
| 699.571 | 0.68 |
| 699.765 | 0.678 |
| 699.959 | 0.678 |
| 700.154 | 0.677 |
| 700.348 | 0.677 |
| 700.542 | 0.675 |
| 700.736 | 0.675 |
| 700.93 | 0.673 |
| 701.125 | 0.673 |
| 701.319 | 0.673 |
| 701.513 | 0.672 |
| 701.707 | 0.671 |
| 701.901 | 0.67 |
| 702.095 | 0.67 |
| 702.289 | 0.669 |
| 702.483 | 0.668 |
| 702.677 | 0.668 |
| 702.871 | 0.668 |
| 703.065 | 0.667 |
| 703.259 | 0.666 |
| 703.453 | 0.665 |
| 703.647 | 0.664 |
| 703.841 | 0.663 |
| 704.035 | 0.662 |
| 704.229 | 0.662 |
| 704.423 | 0.662 |
| 704.617 | 0.661 |
| 704.811 | 0.661 |
| 705.005 | 0.659 |
| 705.199 | 0.659 |
| 705.392 | 0.658 |
| 705.586 | 0.657 |
| 705.78 | 0.659 |
| 705.974 | 0.658 |
| 706.168 | 0.659 |
| 706.361 | 0.657 |
| 706.555 | 0.657 |
| 706.749 | 0.658 |
| 706.943 | 0.658 |
| 707.136 | 0.659 |
| 707.33 | 0.658 |
| 707.524 | 0.659 |
| 707.717 | 0.66 |
| 707.911 | 0.661 |
| 708.105 | 0.661 |
| 708.298 | 0.662 |
| 708.492 | 0.664 |
| 708.685 | 0.664 |
| 708.879 | 0.665 |
| 709.073 | 0.665 |
| 709.266 | 0.667 |
| 709.46 | 0.668 |
| 709.653 | 0.669 |
| 709.847 | 0.672 |
| 710.04 | 0.672 |
| 710.234 | 0.673 |
| 710.427 | 0.675 |
| 710.62 | 0.676 |
| 710.814 | 0.678 |
| 711.007 | 0.68 |
| 711.201 | 0.684 |
| 711.394 | 0.686 |
| 711.587 | 0.686 |
| 711.781 | 0.688 |
| 711.974 | 0.69 |
| 712.167 | 0.69 |
| 712.361 | 0.694 |
| 712.554 | 0.696 |
| 712.747 | 0.699 |
| 712.94 | 0.701 |
| 713.134 | 0.702 |
| 713.327 | 0.703 |
| 713.52 | 0.704 |
| 713.713 | 0.708 |
| 713.906 | 0.708 |
| 714.1 | 0.71 |
| 714.293 | 0.712 |
| 714.486 | 0.713 |
| 714.679 | 0.713 |
| 714.872 | 0.713 |
| 715.065 | 0.715 |
| 715.258 | 0.714 |
| 715.451 | 0.713 |
| 715.644 | 0.713 |
| 715.837 | 0.714 |
| 716.03 | 0.713 |
| 716.223 | 0.714 |
| 716.416 | 0.713 |
| 716.609 | 0.709 |
| 716.802 | 0.709 |
| 716.995 | 0.707 |
| 717.188 | 0.708 |
| 717.381 | 0.706 |
| 717.574 | 0.704 |
| 717.766 | 0.702 |
| 717.959 | 0.698 |
| 718.152 | 0.698 |
| 718.345 | 0.696 |
| 718.538 | 0.695 |
| 718.731 | 0.692 |
| 718.923 | 0.689 |
| 719.116 | 0.687 |
| 719.309 | 0.685 |
| 719.502 | 0.683 |
| 719.694 | 0.681 |
| 719.887 | 0.681 |
| 720.08 | 0.678 |
| 720.272 | 0.675 |
| 720.465 | 0.671 |
| 720.658 | 0.666 |
| 720.85 | 0.664 |
| 721.043 | 0.662 |
| 721.235 | 0.66 |
| 721.428 | 0.658 |
| 721.62 | 0.653 |
| 721.813 | 0.652 |
| 722.006 | 0.648 |
| 722.198 | 0.647 |
| 722.391 | 0.643 |
| 722.583 | 0.641 |
| 722.775 | 0.639 |
| 722.968 | 0.636 |
| 723.16 | 0.634 |
| 723.353 | 0.632 |
| 723.545 | 0.629 |
| 723.738 | 0.629 |
| 723.93 | 0.626 |
| 724.122 | 0.624 |
| 724.315 | 0.622 |
| 724.507 | 0.621 |
| 724.699 | 0.62 |
| 724.891 | 0.616 |
| 725.084 | 0.617 |
| 725.276 | 0.617 |
| 725.468 | 0.615 |
| 725.66 | 0.616 |
| 725.853 | 0.615 |
| 726.045 | 0.615 |
| 726.237 | 0.614 |
| 726.429 | 0.612 |
| 726.621 | 0.614 |
| 726.814 | 0.612 |
| 727.006 | 0.614 |
| 727.198 | 0.613 |
| 727.39 | 0.615 |
| 727.582 | 0.614 |
| 727.774 | 0.616 |
| 727.966 | 0.616 |
| 728.158 | 0.618 |
| 728.35 | 0.618 |
| 728.542 | 0.619 |
| 728.734 | 0.621 |
| 728.926 | 0.622 |
| 729.118 | 0.623 |
| 729.31 | 0.625 |
| 729.502 | 0.626 |
| 729.694 | 0.63 |
| 729.886 | 0.629 |
| 730.077 | 0.632 |
| 730.269 | 0.633 |
| 730.461 | 0.636 |
| 730.653 | 0.636 |
| 730.845 | 0.64 |
| 731.036 | 0.64 |
| 731.228 | 0.643 |
| 731.42 | 0.643 |
| 731.612 | 0.647 |
| 731.803 | 0.647 |
| 731.995 | 0.651 |
| 732.187 | 0.653 |
| 732.379 | 0.657 |
| 732.57 | 0.656 |
| 732.762 | 0.66 |
| 732.953 | 0.662 |
| 733.145 | 0.67 |
| 733.337 | 0.67 |
| 733.528 | 0.674 |
| 733.72 | 0.672 |
| 733.911 | 0.678 |
| 734.103 | 0.679 |
| 734.294 | 0.684 |
| 734.486 | 0.682 |
| 734.677 | 0.684 |
| 734.869 | 0.68 |
| 735.06 | 0.68 |
| 735.252 | 0.677 |
| 735.443 | 0.676 |
| 735.635 | 0.671 |
| 735.826 | 0.67 |
| 736.017 | 0.664 |
| 736.209 | 0.661 |
| 736.4 | 0.653 |
| 736.592 | 0.649 |
| 736.783 | 0.641 |
| 736.974 | 0.637 |
| 737.165 | 0.631 |
| 737.357 | 0.628 |
| 737.548 | 0.621 |
| 737.739 | 0.616 |
| 737.93 | 0.609 |
| 738.122 | 0.607 |
| 738.313 | 0.599 |
| 738.504 | 0.596 |
| 738.695 | 0.591 |
| 738.886 | 0.589 |
| 739.077 | 0.586 |
| 739.269 | 0.583 |
| 739.46 | 0.58 |
| 739.651 | 0.58 |
| 739.842 | 0.575 |
| 740.033 | 0.576 |
| 740.224 | 0.569 |
| 740.415 | 0.572 |
| 740.606 | 0.565 |
| 740.797 | 0.567 |
| 740.988 | 0.565 |
| 741.179 | 0.565 |
| 741.37 | 0.563 |
| 741.561 | 0.562 |
| 741.752 | 0.56 |
| 741.942 | 0.561 |
| 742.133 | 0.558 |
| 742.324 | 0.559 |
| 742.515 | 0.555 |
| 742.706 | 0.557 |
| 742.897 | 0.554 |
| 743.087 | 0.554 |
| 743.278 | 0.551 |
| 743.469 | 0.551 |
| 743.66 | 0.549 |
| 743.85 | 0.548 |
| 744.041 | 0.545 |
| 744.232 | 0.543 |
| 744.423 | 0.54 |
| 744.613 | 0.539 |
| 744.804 | 0.536 |
| 744.994 | 0.536 |
| 745.185 | 0.53 |
| 745.376 | 0.53 |
| 745.566 | 0.524 |
| 745.757 | 0.524 |
| 745.947 | 0.519 |
| 746.138 | 0.518 |
| 746.328 | 0.515 |
| 746.519 | 0.515 |
| 746.709 | 0.512 |
| 746.9 | 0.509 |
| 747.09 | 0.506 |
| 747.281 | 0.505 |
| 747.471 | 0.5 |
| 747.662 | 0.5 |
| 747.852 | 0.495 |
| 748.042 | 0.495 |
| 748.233 | 0.49 |
| 748.423 | 0.49 |
| 748.613 | 0.486 |
| 748.804 | 0.486 |
| 748.994 | 0.484 |
| 749.184 | 0.484 |
| 749.375 | 0.48 |
| 749.565 | 0.481 |
| 749.755 | 0.478 |
| 749.945 | 0.479 |
| 750.136 | 0.475 |
| 750.326 | 0.476 |
| 750.516 | 0.473 |
| 750.706 | 0.475 |
| 750.896 | 0.471 |
| 751.086 | 0.471 |
| 751.276 | 0.466 |
| 751.467 | 0.468 |
| 751.657 | 0.465 |
| 751.847 | 0.467 |
| 752.037 | 0.464 |
| 752.227 | 0.463 |
| 752.417 | 0.459 |
| 752.607 | 0.459 |
| 752.797 | 0.455 |
| 752.987 | 0.455 |
| 753.177 | 0.451 |
| 753.367 | 0.45 |
| 753.556 | 0.445 |
| 753.746 | 0.444 |
| 753.936 | 0.44 |
| 754.126 | 0.439 |
| 754.316 | 0.436 |
| 754.506 | 0.436 |
| 754.696 | 0.432 |
| 754.885 | 0.431 |
| 755.075 | 0.427 |
| 755.265 | 0.425 |
| 755.455 | 0.42 |
| 755.644 | 0.418 |
| 755.834 | 0.413 |
| 756.024 | 0.412 |
| 756.214 | 0.407 |
| 756.403 | 0.407 |
| 756.593 | 0.402 |
| 756.782 | 0.401 |
| 756.972 | 0.395 |
| 757.162 | 0.397 |
| 757.351 | 0.391 |
| 757.541 | 0.392 |
| 757.73 | 0.385 |
| 757.92 | 0.387 |
| 758.109 | 0.384 |
| 758.299 | 0.385 |
| 758.488 | 0.381 |
| 758.678 | 0.381 |
| 758.867 | 0.378 |
| 759.057 | 0.378 |
| 759.246 | 0.375 |
| 759.436 | 0.377 |
| 759.625 | 0.375 |
| 759.814 | 0.377 |
| 760.004 | 0.373 |
| 760.193 | 0.374 |
| 760.383 | 0.372 |
| 760.572 | 0.373 |
| 760.761 | 0.371 |
| 760.95 | 0.374 |
| 761.14 | 0.371 |
| 761.329 | 0.374 |
| 761.518 | 0.374 |
| 761.707 | 0.377 |
| 761.897 | 0.376 |
| 762.086 | 0.378 |
| 762.275 | 0.379 |
| 762.464 | 0.385 |
| 762.653 | 0.386 |
| 762.842 | 0.393 |
| 763.031 | 0.395 |
| 763.221 | 0.402 |
| 763.41 | 0.405 |
| 763.599 | 0.416 |
| 763.788 | 0.424 |
| 763.977 | 0.437 |
| 764.166 | 0.447 |
| 764.355 | 0.463 |
| 764.544 | 0.476 |
| 764.733 | 0.493 |
| 764.922 | 0.507 |
| 765.11 | 0.526 |
| 765.299 | 0.54 |
| 765.488 | 0.558 |
| 765.677 | 0.572 |
| 765.866 | 0.589 |
| 766.055 | 0.597 |
| 766.244 | 0.606 |
| 766.432 | 0.605 |
| 766.621 | 0.603 |
| 766.81 | 0.592 |
| 766.999 | 0.583 |
| 767.188 | 0.568 |
| 767.376 | 0.553 |
| 767.565 | 0.533 |
| 767.754 | 0.515 |
| 767.942 | 0.494 |
| 768.131 | 0.476 |
| 768.32 | 0.454 |
| 768.508 | 0.437 |
| 768.697 | 0.415 |
| 768.885 | 0.4 |
| 769.074 | 0.382 |
| 769.263 | 0.369 |
| 769.451 | 0.351 |
| 769.64 | 0.339 |
| 769.828 | 0.324 |
| 770.017 | 0.316 |
| 770.205 | 0.304 |
| 770.394 | 0.297 |
| 770.582 | 0.286 |
| 770.771 | 0.28 |
| 770.959 | 0.27 |
| 771.147 | 0.265 |
| 771.336 | 0.256 |
| 771.524 | 0.252 |
| 771.712 | 0.244 |
| 771.901 | 0.24 |
| 772.089 | 0.233 |
| 772.277 | 0.231 |
| 772.466 | 0.226 |
| 772.654 | 0.225 |
| 772.842 | 0.22 |
| 773.03 | 0.216 |
| 773.219 | 0.21 |
| 773.407 | 0.209 |
| 773.595 | 0.204 |
| 773.783 | 0.203 |
| 773.971 | 0.197 |
| 774.159 | 0.195 |
| 774.348 | 0.189 |
| 774.536 | 0.188 |
| 774.724 | 0.184 |
| 774.912 | 0.183 |
| 775.1 | 0.179 |
| 775.288 | 0.179 |
| 775.476 | 0.174 |
| 775.664 | 0.171 |
| 775.852 | 0.166 |
| 776.04 | 0.164 |
| 776.228 | 0.159 |
| 776.416 | 0.159 |
| 776.604 | 0.154 |
| 776.792 | 0.154 |
| 776.979 | 0.148 |
| 777.167 | 0.147 |
| 777.355 | 0.143 |
| 777.543 | 0.142 |
| 777.731 | 0.138 |
| 777.919 | 0.137 |
| 778.106 | 0.134 |
| 778.294 | 0.134 |
| 778.482 | 0.129 |
| 778.67 | 0.13 |
| 778.857 | 0.126 |
| 779.045 | 0.126 |
| 779.233 | 0.122 |
| 779.42 | 0.121 |
| 779.608 | 0.117 |
| 779.796 | 0.117 |
| 779.983 | 0.113 |
| 780.171 | 0.114 |
| 780.359 | 0.111 |
| 780.546 | 0.111 |
| 780.734 | 0.107 |
| 780.921 | 0.107 |
| 781.109 | 0.104 |
| 781.296 | 0.105 |
| 781.484 | 0.102 |
| 781.671 | 0.101 |
| 781.859 | 0.097 |
| 782.046 | 0.098 |
| 782.233 | 0.095 |
| 782.421 | 0.096 |
| 782.608 | 0.093 |
| 782.796 | 0.094 |
| 782.983 | 0.091 |
| 783.17 | 0.09 |
| 783.358 | 0.087 |
| 783.545 | 0.088 |
| 783.732 | 0.085 |
| 783.92 | 0.086 |
| 784.107 | 0.083 |
| 784.294 | 0.084 |
| 784.481 | 0.081 |
| 784.668 | 0.081 |
| 784.856 | 0.078 |
| 785.043 | 0.079 |
| 785.23 | 0.076 |
| 785.417 | 0.077 |
| 785.604 | 0.075 |
| 785.791 | 0.076 |
| 785.978 | 0.073 |
| 786.165 | 0.073 |
| 786.352 | 0.07 |
| 786.54 | 0.071 |
| 786.727 | 0.069 |
| 786.914 | 0.07 |
| 787.101 | 0.068 |
| 787.287 | 0.068 |
| 787.474 | 0.065 |
| 787.661 | 0.066 |
| 787.848 | 0.065 |
| 788.035 | 0.067 |
| 788.222 | 0.064 |
| 788.409 | 0.065 |
| 788.596 | 0.063 |
| 788.783 | 0.065 |
| 788.969 | 0.064 |
| 789.156 | 0.066 |
| 789.343 | 0.065 |
| 789.53 | 0.068 |
| 789.717 | 0.066 |
| 789.903 | 0.068 |
| 790.09 | 0.067 |
| 790.277 | 0.069 |
| 790.463 | 0.068 |
| 790.65 | 0.071 |
| 790.837 | 0.071 |
| 791.023 | 0.073 |
| 791.21 | 0.071 |
| 791.396 | 0.072 |
| 791.583 | 0.071 |
| 791.77 | 0.074 |
| 791.956 | 0.072 |
| 792.143 | 0.072 |
| 792.329 | 0.069 |
| 792.516 | 0.069 |
| 792.702 | 0.066 |
| 792.889 | 0.066 |
| 793.075 | 0.063 |
| 793.262 | 0.063 |
| 793.448 | 0.059 |
| 793.634 | 0.059 |
| 793.821 | 0.056 |
| 794.007 | 0.056 |
| 794.193 | 0.052 |
| 794.38 | 0.052 |
| 794.566 | 0.049 |
| 794.752 | 0.049 |
| 794.939 | 0.046 |
| 795.125 | 0.046 |
| 795.311 | 0.044 |
| 795.497 | 0.044 |
| 795.684 | 0.042 |
| 795.87 | 0.043 |
| 796.056 | 0.041 |
| 796.242 | 0.042 |
| 796.428 | 0.04 |
| 796.614 | 0.04 |
| 796.8 | 0.039 |
| 796.986 | 0.04 |
| 797.173 | 0.038 |
| 797.359 | 0.039 |
| 797.545 | 0.038 |
| 797.731 | 0.039 |
| 797.917 | 0.037 |
| 798.103 | 0.038 |
| 798.289 | 0.037 |
| 798.475 | 0.039 |
| 798.661 | 0.038 |
| 798.846 | 0.039 |
| 799.032 | 0.038 |
| 799.218 | 0.039 |
| 799.404 | 0.038 |
| 799.59 | 0.038 |
| 799.776 | 0.038 |
| 799.962 | 0.038 |
| 800.147 | 0.038 |
| 800.333 | 0.038 |
| 800.519 | 0.037 |
| 800.705 | 0.037 |
| 800.89 | 0.036 |
| 801.076 | 0.037 |
| 801.262 | 0.035 |
| 801.447 | 0.036 |
| 801.633 | 0.034 |
| 801.819 | 0.034 |
| 802.004 | 0.033 |
| 802.19 | 0.033 |
| 802.376 | 0.032 |
| 802.561 | 0.032 |
| 802.747 | 0.03 |
| 802.932 | 0.031 |
| 803.118 | 0.03 |
| 803.303 | 0.03 |
| 803.489 | 0.029 |
| 803.674 | 0.029 |
| 803.86 | 0.027 |
| 804.045 | 0.028 |
| 804.231 | 0.027 |
| 804.416 | 0.027 |
| 804.601 | 0.026 |
| 804.787 | 0.026 |
| 804.972 | 0.025 |
| 805.157 | 0.024 |
| 805.343 | 0.024 |
| 805.528 | 0.024 |
| 805.713 | 0.022 |
| 805.899 | 0.023 |
| 806.084 | 0.022 |
| 806.269 | 0.022 |
| 806.454 | 0.021 |
| 806.64 | 0.021 |
| 806.825 | 0.021 |
| 807.01 | 0.02 |
| 807.195 | 0.02 |
| 807.38 | 0.02 |
| 807.565 | 0.02 |
| 807.75 | 0.02 |
| 807.935 | 0.019 |
| 808.121 | 0.019 |
| 808.306 | 0.019 |
| 808.491 | 0.019 |
| 808.676 | 0.018 |
| 808.861 | 0.018 |
| 809.046 | 0.018 |
| 809.231 | 0.018 |
| 809.415 | 0.018 |
| 809.6 | 0.019 |
| 809.785 | 0.018 |
| 809.97 | 0.018 |
| 810.155 | 0.017 |
| 810.34 | 0.018 |
| 810.525 | 0.017 |
| 810.71 | 0.017 |
| 810.894 | 0.017 |
| 811.079 | 0.017 |
| 811.264 | 0.017 |
| 811.449 | 0.017 |
| 811.633 | 0.016 |
| 811.818 | 0.017 |
| 812.003 | 0.016 |
| 812.187 | 0.017 |
| 812.372 | 0.016 |
| 812.557 | 0.017 |
| 812.741 | 0.017 |
| 812.926 | 0.017 |
| 813.111 | 0.016 |
| 813.295 | 0.016 |
| 813.48 | 0.016 |
| 813.664 | 0.016 |
| 813.849 | 0.016 |
| 814.033 | 0.016 |
| 814.218 | 0.016 |
| 814.402 | 0.016 |
| 814.587 | 0.016 |
| 814.771 | 0.016 |
| 814.956 | 0.016 |
| 815.14 | 0.016 |
| 815.324 | 0.016 |
| 815.509 | 0.016 |
| 815.693 | 0.016 |
| 815.877 | 0.016 |
| 816.062 | 0.016 |
| 816.246 | 0.016 |
| 816.43 | 0.016 |
| 816.615 | 0.017 |
| 816.799 | 0.017 |
| 816.983 | 0.017 |
| 817.167 | 0.017 |
| 817.352 | 0.017 |
| 817.536 | 0.017 |
| 817.72 | 0.018 |
| 817.904 | 0.017 |
| 818.088 | 0.018 |
| 818.272 | 0.018 |
| 818.456 | 0.019 |
| 818.64 | 0.019 |
| 818.824 | 0.02 |
| 819.008 | 0.02 |
| 819.193 | 0.021 |
| 819.377 | 0.021 |
| 819.561 | 0.023 |
| 819.744 | 0.024 |
| 819.928 | 0.026 |
| 820.112 | 0.027 |
| 820.296 | 0.03 |
| 820.48 | 0.032 |
| 820.664 | 0.035 |
| 820.848 | 0.037 |
| 821.032 | 0.042 |
| 821.216 | 0.046 |
| 821.399 | 0.053 |
| 821.583 | 0.059 |
| 821.767 | 0.069 |
| 821.951 | 0.077 |
| 822.134 | 0.092 |
| 822.318 | 0.105 |
| 822.502 | 0.126 |
| 822.686 | 0.144 |
| 822.869 | 0.17 |
| 823.053 | 0.193 |
| 823.237 | 0.222 |
| 823.42 | 0.249 |
| 823.604 | 0.283 |
| 823.787 | 0.314 |
| 823.971 | 0.347 |
| 824.154 | 0.375 |
| 824.338 | 0.408 |
| 824.522 | 0.434 |
| 824.705 | 0.462 |
| 824.888 | 0.479 |
| 825.072 | 0.498 |
| 825.255 | 0.503 |
| 825.439 | 0.513 |
| 825.622 | 0.509 |
| 825.806 | 0.511 |
| 825.989 | 0.5 |
| 826.172 | 0.491 |
| 826.356 | 0.473 |
| 826.539 | 0.458 |
| 826.722 | 0.438 |
| 826.906 | 0.422 |
| 827.089 | 0.4 |
| 827.272 | 0.387 |
| 827.455 | 0.366 |
| 827.639 | 0.353 |
| 827.822 | 0.333 |
| 828.005 | 0.324 |
| 828.188 | 0.311 |
| 828.371 | 0.303 |
| 828.554 | 0.292 |
| 828.737 | 0.289 |
| 828.921 | 0.28 |
| 829.104 | 0.279 |
| 829.287 | 0.27 |
| 829.47 | 0.268 |
| 829.653 | 0.257 |
| 829.836 | 0.252 |
| 830.019 | 0.239 |
| 830.202 | 0.23 |
| 830.385 | 0.213 |
| 830.568 | 0.2 |
| 830.75 | 0.18 |
| 830.933 | 0.165 |
| 831.116 | 0.146 |
| 831.299 | 0.134 |
| 831.482 | 0.116 |
| 831.665 | 0.105 |
| 831.848 | 0.089 |
| 832.03 | 0.079 |
| 832.213 | 0.068 |
| 832.396 | 0.061 |
| 832.579 | 0.054 |
| 832.761 | 0.049 |
| 832.944 | 0.044 |
| 833.127 | 0.041 |
| 833.309 | 0.037 |
| 833.492 | 0.035 |
| 833.675 | 0.034 |
| 833.857 | 0.034 |
| 834.04 | 0.032 |
| 834.222 | 0.033 |
| 834.405 | 0.032 |
| 834.588 | 0.034 |
| 834.77 | 0.034 |
| 834.953 | 0.036 |
| 835.135 | 0.037 |
| 835.318 | 0.041 |
| 835.5 | 0.042 |
| 835.682 | 0.045 |
| 835.865 | 0.046 |
| 836.047 | 0.049 |
| 836.23 | 0.048 |
| 836.412 | 0.05 |
| 836.594 | 0.049 |
| 836.777 | 0.049 |
| 836.959 | 0.045 |
| 837.141 | 0.043 |
| 837.324 | 0.039 |
| 837.506 | 0.038 |
| 837.688 | 0.034 |
| 837.87 | 0.031 |
| 838.052 | 0.028 |
| 838.235 | 0.026 |
| 838.417 | 0.022 |
| 838.599 | 0.021 |
| 838.781 | 0.018 |
| 838.963 | 0.017 |
| 839.145 | 0.015 |
| 839.327 | 0.014 |
| 839.509 | 0.013 |
| 839.691 | 0.013 |
| 839.874 | 0.012 |
| 840.056 | 0.011 |
| 840.238 | 0.01 |
| 840.419 | 0.01 |
| 840.601 | 0.009 |
| 840.783 | 0.01 |
| 840.965 | 0.009 |
| 841.147 | 0.009 |
| 841.329 | 0.009 |
| 841.511 | 0.009 |
| 841.693 | 0.009 |
| 841.875 | 0.009 |
| 842.056 | 0.009 |
| 842.238 | 0.009 |
| 842.42 | 0.009 |
| 842.602 | 0.009 |
| 842.783 | 0.009 |
| 842.965 | 0.01 |
| 843.147 | 0.01 |
| 843.329 | 0.01 |
| 843.51 | 0.009 |
| 843.692 | 0.009 |
| 843.874 | 0.008 |
| 844.055 | 0.008 |
| 844.237 | 0.007 |
| 844.418 | 0.007 |
| 844.6 | 0.006 |
| 844.781 | 0.006 |
| 844.963 | 0.006 |
| 845.144 | 0.006 |
| 845.326 | 0.005 |
| 845.507 | 0.005 |
| 845.689 | 0.005 |
| 845.87 | 0.005 |
| 846.052 | 0.004 |
| 846.233 | 0.004 |
| 846.414 | 0.004 |
| 846.596 | 0.004 |
| 846.777 | 0.004 |
| 846.958 | 0.004 |
| 847.14 | 0.003 |
| 847.321 | 0.003 |
| 847.502 | 0.003 |
| 847.684 | 0.003 |
| 847.865 | 0.004 |
| 848.046 | 0.004 |
| 848.227 | 0.003 |
| 848.408 | 0.003 |
| 848.59 | 0.003 |
| 848.771 | 0.003 |
| 848.952 | 0.004 |
| 849.133 | 0.003 |
| 849.314 | 0.003 |
| 849.495 | 0.003 |
| 849.676 | 0.003 |
| 849.857 | 0.003 |
| 850.038 | 0.002 |
| 850.219 | 0.002 |
| 850.4 | 0.002 |
| 850.581 | 0.003 |
| 850.762 | 0.003 |
| 850.943 | 0.003 |
| 851.124 | 0.002 |
| 851.305 | 0.002 |
| 851.486 | 0.003 |
| 851.667 | 0.003 |
| 851.847 | 0.003 |
| 852.028 | 0.003 |
| 852.209 | 0.003 |
| 852.39 | 0.003 |
| 852.571 | 0.003 |
| 852.751 | 0.003 |
| 852.932 | 0.003 |
| 853.113 | 0.002 |
| 853.293 | 0.002 |
| 853.474 | 0.002 |
| 853.655 | 0.002 |
| 853.835 | 0.003 |
| 854.016 | 0.003 |
| 854.197 | 0.002 |
| 854.377 | 0.002 |
| 854.558 | 0.002 |
| 854.738 | 0.002 |
| 854.919 | 0.002 |
| 855.099 | 0.002 |
| 855.28 | 0.003 |
| 855.46 | 0.003 |
| 855.641 | 0.004 |
| 855.821 | 0.003 |
| 856.002 | 0.003 |
| 856.182 | 0.002 |
| 856.362 | 0.002 |
| 856.543 | 0.002 |
| 856.723 | 0.003 |
| 856.903 | 0.003 |
| 857.084 | 0.003 |
| 857.264 | 0.002 |
| 857.444 | 0.003 |
| 857.625 | 0.003 |
| 857.805 | 0.002 |
| 857.985 | 0.002 |
| 858.165 | 0.002 |
| 858.345 | 0.002 |
| 858.526 | 0.002 |
| 858.706 | 0.002 |
| 858.886 | 0.003 |
| 859.066 | 0.003 |
| 859.246 | 0.003 |
| 859.426 | 0.003 |
| 859.606 | 0.002 |
| 859.786 | 0.002 |
| 859.966 | 0.002 |
| 860.146 | 0.001 |
| 860.326 | 0.001 |
| 860.506 | 0.002 |
| 860.686 | 0.002 |
| 860.866 | 0.002 |
| 861.046 | 0.002 |
| 861.226 | 0.002 |
| 861.406 | 0.002 |
| 861.586 | 0.002 |
| 861.765 | 0.002 |
| 861.945 | 0.002 |
| 862.125 | 0.002 |
| 862.305 | 0.001 |
| 862.485 | 0.001 |
| 862.664 | 0.001 |
| 862.844 | 0.002 |
| 863.024 | 0.002 |
| 863.203 | 0.002 |
| 863.383 | 0.001 |
| 863.563 | 0.001 |
| 863.742 | 0.001 |
| 863.922 | 0.001 |
| 864.102 | 0.001 |
| 864.281 | 0.002 |
| 864.461 | 0.002 |
| 864.64 | 0.001 |
| 864.82 | 0.001 |
| 864.999 | 0.001 |
| 865.179 | 0.001 |
| 865.358 | 0.001 |
| 865.538 | 0.001 |
| 865.717 | 0.002 |
| 865.896 | 0.003 |
| 866.076 | 0.003 |
| 866.255 | 0.002 |
| 866.435 | 0.001 |
| 866.614 | 0.001 |
| 866.793 | 0.002 |
| 866.973 | 0.003 |
| 867.152 | 0.003 |
| 867.331 | 0.003 |
| 867.51 | 0.002 |
| 867.69 | 0.001 |
| 867.869 | 0 |
| 868.048 | 0.001 |
| 868.227 | 0.002 |
| 868.406 | 0.003 |
| 868.585 | 0.002 |
| 868.765 | 0.003 |
| 868.944 | 0.003 |
| 869.123 | 0.002 |
| 869.302 | 0.001 |
| 869.481 | 0.001 |
| 869.66 | 0.002 |
| 869.839 | 0.003 |
| 870.018 | 0.003 |
| 870.197 | 0.003 |
| 870.376 | 0.002 |
| 870.555 | 0.001 |
| 870.734 | 0.001 |
| 870.912 | 0.002 |
| 871.091 | 0.003 |
| 871.27 | 0.003 |
| 871.449 | 0.003 |
| 871.628 | 0.003 |
| 871.807 | 0.002 |
| 871.985 | 0.002 |
| 872.164 | 0.001 |
| 872.343 | 0.001 |
| 872.522 | 0.001 |
| 872.7 | 0.002 |
| 872.879 | 0.003 |
| 873.058 | 0.003 |
| 873.236 | 0.003 |
| 873.415 | 0.002 |
| 873.594 | 0.002 |
| 873.772 | 0.002 |
| 873.951 | 0.003 |
| 874.129 | 0.002 |
| 874.308 | 0.002 |
| 874.486 | 0.002 |
| 874.665 | 0.002 |
| 874.843 | 0.002 |
| 875.022 | 0.003 |
| 875.2 | 0.002 |
| 875.379 | 0.003 |
| 875.557 | 0.003 |
| 875.736 | 0.003 |
| 875.914 | 0.002 |
| 876.092 | 0.001 |
| 876.271 | 0.001 |
| 876.449 | 0.002 |
| 876.627 | 0.003 |
| 876.805 | 0.003 |
| 876.984 | 0.003 |
| 877.162 | 0.002 |
| 877.34 | 0.003 |
| 877.518 | 0.003 |
| 877.697 | 0.003 |
| 877.875 | 0.003 |
| 878.053 | 0.002 |
| 878.231 | 0.002 |
| 878.409 | 0.002 |
| 878.587 | 0.002 |
| 878.765 | 0.002 |
| 878.943 | 0.003 |
| 879.121 | 0.003 |
| 879.299 | 0.003 |
| 879.477 | 0.004 |
| 879.655 | 0.005 |
| 879.833 | 0.005 |
| 880.011 | 0.004 |
| 880.189 | 0.003 |
| 880.367 | 0.004 |
| 880.545 | 0.005 |
| 880.723 | 0.005 |
| 880.901 | 0.004 |
| 881.079 | 0.005 |
| 881.256 | 0.006 |
| 881.434 | 0.008 |
| 881.612 | 0.008 |
| 881.79 | 0.008 |
| 881.967 | 0.008 |
| 882.145 | 0.008 |
| 882.323 | 0.009 |
| 882.501 | 0.009 |
| 882.678 | 0.01 |
| 882.856 | 0.012 |
| 883.033 | 0.013 |
| 883.211 | 0.013 |
| 883.389 | 0.014 |
| 883.566 | 0.014 |
| 883.744 | 0.014 |
| 883.921 | 0.014 |
| 884.099 | 0.015 |
| 884.276 | 0.015 |
| 884.454 | 0.014 |
| 884.631 | 0.014 |
| 884.809 | 0.014 |
| 884.986 | 0.014 |
| 885.163 | 0.014 |
| 885.341 | 0.013 |
| 885.518 | 0.013 |
| 885.696 | 0.012 |
| 885.873 | 0.012 |
| 886.05 | 0.011 |
| 886.227 | 0.011 |
| 886.405 | 0.011 |
| 886.582 | 0.01 |
| 886.759 | 0.01 |
| 886.936 | 0.01 |
| 887.114 | 0.009 |
| 887.291 | 0.009 |
| 887.468 | 0.008 |
| 887.645 | 0.007 |
| 887.822 | 0.007 |
| 887.999 | 0.006 |
| 888.176 | 0.006 |
| 888.353 | 0.007 |
| 888.53 | 0.007 |
| 888.707 | 0.007 |
| 888.884 | 0.006 |
| 889.061 | 0.006 |
| 889.238 | 0.005 |
| 889.415 | 0.006 |
| 889.592 | 0.006 |
| 889.769 | 0.006 |
| 889.946 | 0.005 |
| 890.123 | 0.004 |
| 890.3 | 0.004 |
| 890.477 | 0.004 |
| 890.653 | 0.004 |
| 890.83 | 0.004 |
| 891.007 | 0.005 |
| 891.184 | 0.004 |
| 891.36 | 0.004 |
| 891.537 | 0.003 |
| 891.714 | 0.003 |
| 891.891 | 0.003 |
| 892.067 | 0.002 |
| 892.244 | 0.003 |
| 892.421 | 0.003 |
| 892.597 | 0.003 |
| 892.774 | 0.003 |
| 892.95 | 0.003 |
| 893.127 | 0.004 |
| 893.303 | 0.004 |
| 893.48 | 0.003 |
| 893.656 | 0.003 |
| 893.833 | 0.003 |
| 894.009 | 0.004 |
| 894.186 | 0.004 |
| 894.362 | 0.005 |
| 894.538 | 0.005 |
| 894.715 | 0.005 |
| 894.891 | 0.005 |
| 895.068 | 0.005 |
| 895.244 | 0.005 |
| 895.42 | 0.004 |
| 895.596 | 0.005 |
| 895.773 | 0.006 |
| 895.949 | 0.007 |
| 896.125 | 0.008 |
| 896.301 | 0.007 |
| 896.478 | 0.007 |
| 896.654 | 0.006 |
| 896.83 | 0.007 |
| 897.006 | 0.007 |
| 897.182 | 0.007 |
| 897.358 | 0.007 |
| 897.534 | 0.007 |
| 897.71 | 0.007 |
| 897.886 | 0.007 |
| 898.062 | 0.007 |
| 898.238 | 0.008 |
| 898.414 | 0.007 |
| 898.59 | 0.005 |
| 898.766 | 0.005 |
| 898.942 | 0.005 |
| 899.118 | 0.005 |
| 899.294 | 0.004 |
| 899.47 | 0.005 |
| 899.646 | 0.004 |
| 899.821 | 0.005 |
| 899.997 | 0.004 |
| 900.173 | 0.005 |
| 900.349 | 0.005 |
| 900.525 | 0.007 |
| 900.7 | 0.006 |
| 900.876 | 0.006 |
| 901.052 | 0.005 |
| 901.227 | 0.004 |
| 901.403 | 0.004 |
| 901.579 | 0.003 |
| 901.754 | 0.004 |
| 901.93 | 0.003 |
| 902.105 | 0.003 |
| 902.281 | 0.004 |
| 902.456 | 0.004 |
| 902.632 | 0.004 |
| 902.807 | 0.004 |
| 902.983 | 0.004 |
| 903.158 | 0.004 |
| 903.334 | 0.004 |
| 903.509 | 0.005 |
| 903.685 | 0.005 |
| 903.86 | 0.005 |
| 904.035 | 0.006 |
| 904.211 | 0.006 |
| 904.386 | 0.006 |
| 904.561 | 0.004 |
| 904.737 | 0.004 |
| 904.912 | 0.004 |
| 905.087 | 0.005 |
| 905.262 | 0.006 |
| 905.438 | 0.006 |
| 905.613 | 0.006 |
| 905.788 | 0.006 |
| 905.963 | 0.007 |
| 906.138 | 0.007 |
| 906.313 | 0.007 |
| 906.488 | 0.007 |
| 906.663 | 0.007 |
| 906.839 | 0.007 |
| 907.014 | 0.006 |
| 907.189 | 0.006 |
| 907.364 | 0.006 |
| 907.539 | 0.006 |
| 907.714 | 0.007 |
| 907.888 | 0.007 |
| 908.063 | 0.007 |
| 908.238 | 0.006 |
| 908.413 | 0.004 |
| 908.588 | 0.005 |
| 908.763 | 0.005 |
| 908.938 | 0.005 |
| 909.112 | 0.004 |
| 909.287 | 0.003 |
| 909.462 | 0.003 |
| 909.637 | 0.004 |
| 909.811 | 0.005 |
| 909.986 | 0.004 |
| 910.161 | 0.004 |
| 910.336 | 0.003 |
| 910.51 | 0.004 |
| 910.685 | 0.004 |
| 910.859 | 0.003 |
| 911.034 | 0.004 |
| 911.209 | 0.005 |
| 911.383 | 0.004 |
| 911.558 | 0.003 |
| 911.732 | 0.002 |
| 911.907 | 0.002 |
| 912.081 | 0.002 |
| 912.256 | 0.003 |
| 912.43 | 0.003 |
| 912.604 | 0.004 |
| 912.779 | 0.004 |
| 912.953 | 0.004 |
| 913.128 | 0.004 |
| 913.302 | 0.003 |
| 913.476 | 0.004 |
| 913.65 | 0.005 |
| 913.825 | 0.006 |
| 913.999 | 0.005 |
| 914.173 | 0.004 |
| 914.347 | 0.004 |
| 914.522 | 0.005 |
| 914.696 | 0.004 |
| 914.87 | 0.004 |
| 915.044 | 0.001 |
| 915.218 | 0.003 |
| 915.392 | 0.003 |
| 915.566 | 0.005 |
| 915.741 | 0.005 |
| 915.915 | 0.006 |
| 916.089 | 0.006 |
| 916.263 | 0.006 |
| 916.437 | 0.006 |
| 916.611 | 0.006 |
| 916.784 | 0.006 |
| 916.958 | 0.006 |
| 917.132 | 0.007 |
| 917.306 | 0.008 |
| 917.48 | 0.007 |
| 917.654 | 0.007 |
| 917.828 | 0.006 |
| 918.002 | 0.008 |
| 918.175 | 0.008 |
| 918.349 | 0.007 |
| 918.523 | 0.007 |
| 918.697 | 0.007 |
| 918.87 | 0.006 |
| 919.044 | 0.006 |
| 919.218 | 0.006 |
| 919.391 | 0.007 |
| 919.565 | 0.008 |
| 919.739 | 0.007 |
| 919.912 | 0.006 |
| 920.086 | 0.005 |
| 920.259 | 0.005 |
| 920.433 | 0.004 |
| 920.606 | 0.004 |
| 920.78 | 0.004 |
| 920.953 | 0.004 |
| 921.127 | 0.005 |
| 921.3 | 0.005 |
| 921.474 | 0.005 |
| 921.647 | 0.005 |
| 921.82 | 0.005 |
| 921.994 | 0.005 |
| 922.167 | 0.005 |
| 922.34 | 0.005 |
| 922.514 | 0.004 |
| 922.687 | 0.003 |
| 922.86 | 0.002 |
| 923.033 | 0.003 |
| 923.207 | 0.003 |
| 923.38 | 0.001 |
| 923.553 | 0.002 |
| 923.726 | 0.002 |
| 923.899 | 0.003 |
| 924.072 | 0.003 |
| 924.246 | 0.003 |
| 924.419 | 0.003 |
| 924.592 | 0.002 |
| 924.765 | 0.004 |
| 924.938 | 0.003 |
| 925.111 | 0.003 |
| 925.284 | 0.002 |
| 925.457 | 0.003 |
| 925.63 | 0.003 |
| 925.803 | 0.003 |
| 925.976 | 0.003 |
| 926.148 | 0.003 |
| 926.321 | 0.004 |
| 926.494 | 0.003 |
| 926.667 | 0.003 |
| 926.84 | 0.001 |
| 927.013 | 0.003 |
| 927.185 | 0.002 |
| 927.358 | 0.003 |
| 927.531 | 0.002 |
| 927.704 | 0.003 |
| 927.876 | 0.002 |
| 928.049 | 0.002 |
| 928.222 | 0.002 |
| 928.394 | 0.003 |
| 928.567 | 0.003 |
| 928.739 | 0.004 |
| 928.912 | 0.004 |
| 929.084 | 0.004 |
| 929.257 | 0.004 |
| 929.43 | 0.003 |
| 929.602 | 0.003 |
| 929.774 | 0.003 |
| 929.947 | 0.003 |
| 930.119 | 0.003 |
| 930.292 | 0.002 |
| 930.464 | 0.003 |
| 930.637 | 0.002 |
| 930.809 | 0.003 |
| 930.981 | 0.001 |
| 931.154 | 0.002 |
| 931.326 | 0.001 |
| 931.498 | 0.003 |
| 931.67 | 0.003 |
| 931.843 | 0.003 |
| 932.015 | 0.001 |
| 932.187 | 0 |
| 932.359 | 0.001 |
| 932.531 | 0.003 |
| 932.703 | 0.004 |
| 932.876 | 0.003 |
| 933.048 | 0.004 |
| 933.22 | 0.003 |
| 933.392 | 0.003 |
| 933.564 | 0.001 |
| 933.736 | 0 |
| 933.908 | 0.001 |
| 934.08 | 0.002 |
| 934.252 | 0.003 |
| 934.424 | 0.002 |
| 934.596 | 0.002 |
| 934.767 | 0.002 |
| 934.939 | 0 |
| 935.111 | 0.001 |
| 935.283 | 0.002 |
| 935.455 | 0.003 |
| 935.627 | 0.003 |
| 935.798 | 0.001 |
| 935.97 | 0.002 |
| 936.142 | 0.004 |
| 936.314 | 0.005 |
| 936.485 | 0.003 |
| 936.657 | 0.002 |
| 936.829 | 0.003 |
| 937.0 | 0.004 |
| 937.172 | 0.005 |
| 937.344 | 0.004 |
| 937.515 | 0.004 |
| 937.687 | 0.003 |
| 937.858 | 0.001 |
| 938.03 | 0 |
| 938.201 | 0 |
| 938.373 | 0.002 |
| 938.544 | 0.004 |
| 938.716 | 0.005 |
| 938.887 | 0.004 |
| 939.058 | 0.003 |
| 939.23 | 0.003 |
| 939.401 | 0.004 |
| 939.572 | 0.004 |
| 939.744 | 0.004 |
| 939.915 | 0.003 |
| 940.086 | 0.002 |
| 940.258 | 0.002 |
| 940.429 | 0.004 |
| 940.6 | 0.005 |
| 940.771 | 0.004 |
| 940.942 | 0.002 |
| 941.114 | 0.003 |
| 941.285 | 0.004 |
| 941.456 | 0.005 |
| 941.627 | 0.004 |
| 941.798 | 0.002 |
| 941.969 | 0.001 |
| 942.14 | 0.002 |
| 942.311 | 0.002 |
| 942.482 | 0.002 |
| 942.653 | 0 |
| 942.824 | 0 |
| 942.995 | 0 |
| 943.166 | 0 |
| 943.337 | 0 |
| 943.508 | 0.002 |
| 943.678 | 0.002 |
| 943.849 | 0.004 |
| 944.02 | 0.003 |
| 944.191 | 0.002 |
| 944.362 | 0.004 |
| 944.532 | 0.006 |
| 944.703 | 0.008 |
| 944.874 | 0.005 |
| 945.045 | 0.005 |
| 945.215 | 0.004 |
| 945.386 | 0.005 |
| 945.557 | 0.004 |
| 945.727 | 0.004 |
| 945.898 | 0.004 |
| 946.068 | 0.004 |
| 946.239 | 0.002 |
| 946.409 | 0.004 |
| 946.58 | 0.002 |
| 946.75 | 0.003 |
| 946.921 | 0.001 |
| 947.091 | 0.003 |
| 947.262 | 0.003 |
| 947.432 | 0.005 |
| 947.603 | 0.002 |
| 947.773 | 0.001 |
| 947.943 | 0.002 |
| 948.114 | 0.002 |
| 948.284 | 0.003 |
| 948.454 | 0.001 |
| 948.624 | 0.001 |
| 948.795 | 0.001 |
| 948.965 | 0.003 |
| 949.135 | 0.005 |
| 949.305 | 0.004 |
| 949.476 | 0.003 |
| 949.646 | 0.001 |
| 949.816 | 0.002 |
| 949.986 | 0.004 |
| 950.156 | 0.005 |
| 950.326 | 0.005 |
| 950.496 | 0.003 |
| 950.666 | 0.003 |
| 950.836 | 0.005 |
| 951.006 | 0.008 |
| 951.176 | 0.008 |
| 951.346 | 0.006 |
| 951.516 | 0.005 |
| 951.686 | 0.003 |
| 951.856 | 0.004 |
| 952.026 | 0.004 |
| 952.195 | 0.004 |
| 952.365 | 0.003 |
| 952.535 | 0 |
| 952.705 | 0.001 |
| 952.875 | 0.001 |
| 953.044 | 0.003 |
| 953.214 | 0.002 |
| 953.384 | 0.004 |
| 953.553 | 0.004 |
| 953.723 | 0.005 |
| 953.893 | 0.005 |
| 954.062 | 0.002 |
| 954.232 | 0 |
| 954.402 | -0.002 |
| 954.571 | 0.002 |
| 954.741 | 0.004 |
| 954.91 | 0.005 |
| 955.08 | 0.006 |
| 955.249 | 0.003 |
| 955.419 | 0.003 |
| 955.588 | 0.002 |
| 955.757 | 0.004 |
| 955.927 | 0.003 |
| 956.096 | 0.003 |
| 956.266 | 0.003 |
| 956.435 | 0.003 |
| 956.604 | -0.001 |
| 956.774 | -0.001 |
| 956.943 | -0.002 |
| 957.112 | 0.003 |
| 957.281 | 0.005 |
| 957.45 | 0.004 |
| 957.62 | 0.004 |
| 957.789 | 0.004 |
| 957.958 | 0.004 |
| 958.127 | 0.004 |
| 958.296 | 0.002 |
| 958.465 | 0.002 |
| 958.634 | 0.003 |
| 958.803 | 0.003 |
| 958.972 | 0.003 |
| 959.141 | 0.001 |
| 959.31 | 0.003 |
| 959.479 | 0.003 |
| 959.648 | 0.005 |
| 959.817 | 0.003 |
| 959.986 | 0.001 |
| 960.155 | -0.001 |
| 960.324 | -0.001 |
| 960.493 | 0.002 |
| 960.662 | 0.001 |
| 960.83 | 0.003 |
| 960.999 | 0.003 |
| 961.168 | 0.003 |
| 961.337 | 0.002 |
| 961.505 | 0.001 |
| 961.674 | 0.001 |
| 961.843 | 0.002 |
| 962.011 | 0.002 |
| 962.18 | 0.003 |
| 962.349 | 0.002 |
| 962.517 | 0.002 |
| 962.686 | 0.003 |
| 962.854 | 0.003 |
| 963.023 | 0.004 |
| 963.192 | 0.002 |
| 963.36 | 0.004 |
| 963.529 | 0.001 |
| 963.697 | 0.002 |
| 963.865 | 0.001 |
| 964.034 | 0.007 |
| 964.202 | 0.006 |
| 964.371 | 0.007 |
| 964.539 | 0.004 |
| 964.707 | 0.003 |
| 964.876 | -0.002 |
| 965.044 | -0.005 |
| 965.212 | -0.005 |
| 965.38 | 0 |
| 965.549 | 0.002 |
| 965.717 | 0.004 |
| 965.885 | 0.002 |
| 966.053 | 0.003 |
| 966.221 | 0 |
| 966.389 | 0.002 |
| 966.558 | 0 |
| 966.726 | 0.002 |
| 966.894 | -0.002 |
| 967.062 | -0.001 |
| 967.23 | 0.001 |
| 967.398 | 0.003 |
| 967.566 | 0.002 |
| 967.734 | 0.002 |
| 967.902 | 0.002 |
| 968.07 | 0.002 |
| 968.237 | 0.001 |
| 968.405 | 0.003 |
| 968.573 | 0.005 |
| 968.741 | 0.005 |
| 968.909 | 0.003 |
| 969.077 | 0.004 |
| 969.244 | 0.006 |
| 969.412 | 0.008 |
| 969.58 | 0.006 |
| 969.748 | 0.007 |
| 969.915 | 0.006 |
| 970.083 | 0.007 |
| 970.251 | 0.004 |
| 970.418 | 0.006 |
| 970.586 | 0.008 |
| 970.753 | 0.005 |
| 970.921 | 0.001 |
| 971.089 | -0.002 |
| 971.256 | 0.001 |
| 971.424 | -0.002 |
| 971.591 | 0 |
| 971.758 | -0.002 |
| 971.926 | 0.003 |
| 972.093 | 0 |
| 972.261 | 0.002 |
| 972.428 | 0.001 |
| 972.595 | 0 |
| 972.763 | 0.003 |
| 972.93 | 0.001 |
| 973.097 | 0.004 |
| 973.265 | 0 |
| 973.432 | 0.007 |
| 973.599 | 0.006 |
| 973.766 | 0.007 |
| 973.934 | 0.005 |
| 974.101 | 0.006 |
| 974.268 | 0.008 |
| 974.435 | 0.005 |
| 974.602 | 0.006 |
| 974.769 | 0 |
| 974.936 | 0 |
| 975.103 | -0.001 |
| 975.27 | 0 |
| 975.437 | 0 |
| 975.604 | -0.002 |
| 975.771 | 0.004 |
| 975.938 | 0.009 |
| 976.105 | 0.011 |
| 976.272 | 0.009 |
| 976.439 | 0.006 |
| 976.606 | 0 |
| 976.773 | 0 |
| 976.94 | -0.004 |
| 977.106 | 0.003 |
| 977.273 | 0.002 |
| 977.44 | 0.007 |
| 977.607 | 0.003 |
| 977.773 | 0.001 |
| 977.94 | 0.003 |
| 978.107 | 0.004 |
| 978.273 | 0.003 |
| 978.44 | 0.003 |
| 978.607 | 0.003 |
| 978.773 | 0.01 |
| 978.94 | 0.007 |
| 979.106 | 0.005 |
| 979.273 | -0.002 |
| 979.439 | -0.001 |
| 979.606 | 0.002 |
| 979.772 | 0.009 |
| 979.939 | 0.008 |
| 980.105 | 0.007 |
| 980.272 | 0.007 |
| 980.438 | 0.012 |
| 980.604 | 0.017 |
| 980.771 | 0.012 |
| 980.937 | 0.007 |
| 981.103 | 0.007 |
| 981.269 | 0.005 |
| 981.436 | 0.007 |
| 981.602 | 0.003 |
| 981.768 | 0.008 |
| 981.934 | 0.008 |
| 982.101 | -0.001 |
| 982.267 | -0.005 |
| 982.433 | -0.003 |
| 982.599 | 0.004 |
| 982.765 | 0.007 |
| 982.931 | 0.001 |
| 983.097 | 0 |
| 983.263 | 0.002 |
| 983.429 | 0.009 |
| 983.595 | 0.008 |
| 983.761 | 0.005 |
| 983.927 | -0.003 |
| 984.093 | -0.003 |
| 984.259 | -0.005 |
| 984.425 | -0.002 |
| 984.591 | 0.001 |
| 984.756 | 0.012 |
| 984.922 | 0.02 |
| 985.088 | 0.021 |
| 985.254 | 0.013 |
| 985.419 | 0.007 |
| 985.585 | 0.007 |
| 985.751 | 0.006 |
| 985.917 | 0.009 |
| 986.082 | 0.008 |
| 986.248 | 0.01 |
| 986.414 | 0.005 |
| 986.579 | 0 |
| 986.745 | -0.002 |
| 986.91 | -0.002 |
| 987.076 | 0 |
| 987.241 | 0.005 |
| 987.407 | 0.01 |
| 987.572 | 0.012 |
| 987.738 | 0.007 |
| 987.903 | 0.002 |
| 988.069 | -0.001 |
| 988.234 | -0.001 |
| 988.399 | -0.005 |
| 988.565 | -0.004 |
| 988.73 | -0.006 |
| 988.895 | 0.004 |
| 989.061 | -0.001 |
| 989.226 | 0.001 |
| 989.391 | 0 |
| 989.556 | 0.008 |
| 989.722 | 0.009 |
| 989.887 | 0.006 |
| 990.052 | 0.004 |
| 990.217 | 0.004 |
| 990.382 | 0.002 |
| 990.547 | 0.003 |
| 990.712 | 0.004 |
| 990.877 | 0.006 |
| 991.042 | 0.007 |
| 991.207 | 0.008 |
| 991.372 | 0.002 |
| 991.537 | 0.006 |
| 991.702 | 0.006 |
| 991.867 | 0.007 |
| 992.032 | 0 |
| 992.197 | 0 |
| 992.362 | 0.005 |
| 992.527 | 0.005 |
| 992.692 | 0.008 |
| 992.856 | 0.009 |
| 993.021 | 0.006 |
| 993.186 | 0 |
| 993.351 | -0.006 |
| 993.515 | 0 |
| 993.68 | -0.004 |
| 993.845 | -0.005 |
| 994.009 | -0.003 |
| 994.174 | 0.005 |
| 994.339 | 0.002 |
| 994.503 | -0.002 |
| 994.668 | -0.008 |
| 994.832 | -0.002 |
| 994.997 | -0.007 |
| 995.161 | 0.004 |
| 995.326 | 0.013 |
| 995.49 | 0.017 |
| 995.655 | 0.019 |
| 995.819 | 0.013 |
| 995.983 | 0.012 |
| 996.148 | 0.005 |
| 996.312 | 0.002 |
| 996.477 | 0.001 |
| 996.641 | 0.007 |
| 996.805 | 0.008 |
| 996.969 | 0.003 |
| 997.134 | 0.001 |
| 997.298 | 0.002 |
| 997.462 | 0.01 |
| 997.626 | 0.006 |
| 997.79 | 0.008 |
| 997.955 | 0.008 |
| 998.119 | 0.01 |
| 998.283 | 0.007 |
| 998.447 | 0.007 |
| 998.611 | 0.013 |
| 998.775 | 0.019 |
| 998.939 | 0.015 |
| 999.103 | 0.003 |
| 999.267 | -0.003 |
| 999.431 | 0.006 |
| 999.595 | 0.012 |
| 999.759 | 0.013 |
| 999.923 | 0.007 |
| 1000.086 | 0.012 |
| 1000.25 | 0.013 |
| 1000.414 | 0.011 |
| 1000.578 | 0.01 |
| 1000.742 | 0.011 |
| 1000.905 | 0.007 |
| 1001.069 | 0.009 |
| 1001.233 | 0.009 |
| 1001.396 | 0.024 |
| 1001.56 | 0.013 |
| 1001.724 | 0.004 |
| 1001.887 | -0.005 |
| 1002.051 | 0.002 |
| 1002.215 | 0.006 |
| 1002.378 | 0.004 |
| 1002.542 | 0.01 |
| 1002.705 | 0.005 |
| 1002.869 | 0.009 |
| 1003.032 | -0.003 |
| 1003.196 | 0.001 |
| 1003.359 | -0.003 |
| 1003.522 | 0.006 |
| 1003.686 | 0.015 |
| 1003.849 | 0.012 |
| 1004.013 | 0.005 |
| 1004.176 | -0.005 |
| 1004.339 | 0.008 |
| 1004.502 | 0.002 |
| 1004.666 | 0.003 |
| 1004.829 | -0.005 |
| 1004.992 | 0.005 |
| 1005.155 | 0.007 |
| 1005.319 | 0.013 |
| 1005.482 | 0.018 |
| 1005.645 | 0.014 |
| 1005.808 | 0.006 |
| 1005.971 | -0.004 |
| 1006.134 | -0.001 |
| 1006.297 | 0.001 |
| 1006.46 | 0.004 |
| 1006.623 | 0.006 |
| 1006.786 | 0.013 |
| 1006.949 | 0.015 |
| 1007.112 | 0.016 |
| 1007.275 | 0.01 |
| 1007.438 | 0.011 |
| 1007.601 | 0.017 |
| 1007.764 | 0.018 |
| 1007.926 | 0.021 |
| 1008.089 | 0.009 |
| 1008.252 | 0.014 |
| 1008.415 | 0.012 |
| 1008.578 | 0.024 |
| 1008.74 | 0.01 |
| 1008.903 | 0.003 |
| 1009.066 | 0.004 |
| 1009.228 | 0.006 |
| 1009.391 | 0.01 |
| 1009.554 | -0.002 |
| 1009.716 | -0.001 |
| 1009.879 | -0.006 |
| 1010.041 | -0.003 |
| 1010.204 | -0.003 |
| 1010.366 | 0.002 |
| 1010.529 | -0.004 |
| 1010.691 | 0.001 |
| 1010.854 | 0.01 |
| 1011.016 | 0.015 |
| 1011.178 | 0.015 |
| 1011.341 | 0.012 |
| 1011.503 | 0.014 |
| 1011.666 | 0.006 |
| 1011.828 | 0.006 |
| 1011.99 | 0.009 |
| 1012.152 | 0.028 |
| 1012.315 | 0.02 |
| 1012.477 | 0.021 |
| 1012.639 | 0.003 |
| 1012.801 | 0.019 |
| 1012.963 | 0.021 |
| 1013.126 | 0.029 |
| 1013.288 | 0.003 |
| 1013.45 | 0.002 |
| 1013.612 | 0.002 |
| 1013.774 | 0.007 |
| 1013.936 | -0.003 |
| 1014.098 | -0.007 |
| 1014.26 | -0.001 |
| 1014.422 | 0.005 |
| 1014.584 | 0.004 |
| 1014.746 | 0.002 |
| 1014.908 | -0.004 |
| 1015.069 | -0.004 |
| 1015.231 | 0.001 |
| 1015.393 | 0.012 |
| 1015.555 | 0.01 |
| 1015.717 | 0.013 |
| 1015.879 | 0 |
| 1016.04 | 0.002 |
| 1016.202 | -0.003 |
| 1016.364 | 0.002 |
| 1016.525 | 0.004 |
| 1016.687 | 0.005 |
| 1016.849 | 0.019 |
| 1017.01 | 0.021 |
| 1017.172 | 0.004 |
| 1017.333 | -0.012 |
| 1017.495 | -0.015 |
| 1017.657 | 0.002 |
| 1017.818 | 0 |
| 1017.98 | -0.001 |
| 1018.141 | -0.02 |
| 1018.302 | -0.014 |
| 1018.464 | 0.001 |
| 1018.625 | 0.048 |
| 1018.787 | 0.039 |
| 1018.948 | 0.03 |
| 1019.109 | 0.013 |
| 1019.271 | 0.017 |
| 1019.432 | 0.021 |
| 1019.593 | 0.017 |
| 1019.754 | 0.016 |
| 1019.916 | 0.007 |
| 1020.077 | -0.012 |
| 1020.238 | 0.01 |
| 1020.399 | 0.008 |
| 1020.56 | 0.022 |
| 1020.721 | 0.012 |
| 1020.883 | 0.014 |
| 1021.044 | 0.014 |
| 1021.205 | 0.007 |
| 1021.366 | 0.013 |
| 1021.527 | 0.015 |
| 1021.688 | 0.039 |
| 1021.849 | 0.035 |
| 1022.01 | 0.019 |
| 1022.17 | 0.001 |
| 1022.331 | -0.007 |
| 1022.492 | 0.009 |
| 1022.653 | -0.004 |
| 1022.814 | 0.011 |
| 1022.975 | 0.017 |
| 1023.135 | 0.042 |
| 1023.296 | 0.039 |
| 1023.457 | 0.024 |
| 1023.618 | 0.019 |
| 1023.778 | 0.017 |
| 1023.939 | 0.024 |
| 1024.1 | 0.025 |
| 1024.26 | 0.009 |
| 1024.421 | 0.001 |
| 1024.582 | -0.015 |
| 1024.742 | -0.011 |
| 1024.903 | -0.004 |
| 1025.063 | 0.016 |
| 1025.224 | 0.022 |
| 1025.384 | 0.003 |
| 1025.545 | -0.022 |
| 1025.705 | -0.029 |
| 1025.865 | -0.025 |
| 1026.026 | -0.033 |
| 1026.186 | -0.017 |
| 1026.347 | 0.015 |
| 1026.507 | 0.026 |
| 1026.667 | 0.017 |
| 1026.827 | 0.008 |
| 1026.988 | 0.026 |
| 1027.148 | 0.022 |
| 1027.308 | 0.016 |
| 1027.468 | 0.004 |
| 1027.629 | 0.015 |
| 1027.789 | 0.006 |
| 1027.949 | 0.016 |
| 1028.109 | 0.02 |
| 1028.269 | 0.019 |
| 1028.429 | -0.023 |
| 1028.589 | -0.017 |
| 1028.749 | -0.008 |
| 1028.909 | 0.035 |
| 1029.069 | 0.029 |
| 1029.229 | 0.027 |
| 1029.389 | 0.021 |
| 1029.549 | 0.003 |
| 1029.709 | 0.003 |
| 1029.869 | 0.005 |
| 1030.028 | 0.011 |
| 1030.188 | 0.005 |
| 1030.348 | 0.007 |
| 1030.508 | 0.006 |
| 1030.668 | 0.017 |
| 1030.827 | -0.009 |
| 1030.987 | -0.005 |
| 1031.147 | -0.035 |
| 1031.306 | -0.005 |
| 1031.466 | 0.001 |
| 1031.626 | 0.03 |
| 1031.785 | 0.014 |
| 1031.945 | -0.003 |
| 1032.104 | 0.007 |
| 1032.264 | 0.012 |
| 1032.423 | 0.034 |
| 1032.583 | 0.011 |
| 1032.742 | -0.019 |
| 1032.902 | -0.017 |
| 1033.061 | -0.009 |
| 1033.22 | 0.019 |
| 1033.38 | 0.011 |
| 1033.539 | 0.006 |
| 1033.699 | 0.007 |
| 1033.858 | 0.014 |
| 1034.017 | 0.031 |
| 1034.176 | 0.043 |
| 1034.336 | 0.053 |
| 1034.495 | 0.034 |
| 1034.654 | 0.054 |
| 1034.813 | 0.044 |
| 1034.972 | 0.076 |
| 1035.131 | 0.058 |
| 1035.291 | 0.054 |
| 1035.45 | 0.021 |
| 1035.609 | 0.019 |
| 1035.768 | 0.031 |
| 1035.927 | 0.033 |
| 1036.086 | 0.025 |
| 1036.245 | 0.003 |
| 1036.404 | -0.007 |
| 1036.563 | 0.01 |
| 1036.722 | 0.012 |
| 1036.88 | 0.006 |
| 1037.039 | -0.012 |
| 1037.198 | -0.012 |
| 1037.357 | 0.014 |
| 1037.516 | 0.021 |
| 1037.675 | 0.022 |
| 1037.833 | 0.023 |
| 1037.992 | -0.009 |
| 1038.151 | 0.013 |
| 1038.309 | 0.004 |
| 1038.468 | 0.022 |
| 1038.627 | -0.007 |
| 1038.785 | 0.01 |
| 1038.944 | 0.036 |
| 1039.102 | 0.047 |
| 1039.261 | 0.034 |
| 1039.42 | 0.015 |
| 1039.578 | 0.019 |
| 1039.737 | 0.042 |
| 1039.895 | 0.019 |
| 1040.053 | 0.019 |
| 1040.212 | -0.01 |
| 1040.37 | 0.009 |